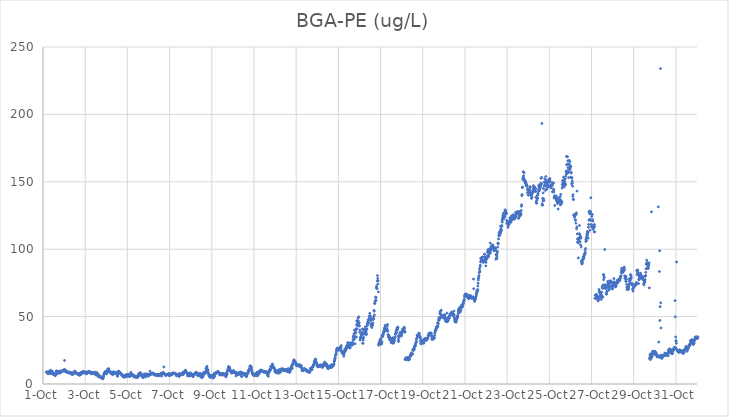
| Category | BGA-PE (ug/L) |
|---|---|
| 44835.166666666664 | 8.73 |
| 44835.177083333336 | 9.15 |
| 44835.1875 | 8.23 |
| 44835.197916666664 | 8.73 |
| 44835.208333333336 | 8.49 |
| 44835.21875 | 7.96 |
| 44835.229166666664 | 7.8 |
| 44835.239583333336 | 7.87 |
| 44835.25 | 8.24 |
| 44835.260416666664 | 7.7 |
| 44835.270833333336 | 7.92 |
| 44835.28125 | 7.89 |
| 44835.291666666664 | 8.7 |
| 44835.302083333336 | 9.3 |
| 44835.3125 | 9.29 |
| 44835.322916666664 | 9.4 |
| 44835.333333333336 | 9.03 |
| 44835.34375 | 9.97 |
| 44835.354166666664 | 8.32 |
| 44835.364583333336 | 7.81 |
| 44835.375 | 7.57 |
| 44835.385416666664 | 9.96 |
| 44835.395833333336 | 9.14 |
| 44835.40625 | 8.86 |
| 44835.416666666664 | 9.18 |
| 44835.427083333336 | 9.05 |
| 44835.4375 | 9.23 |
| 44835.447916666664 | 9.22 |
| 44835.458333333336 | 8.49 |
| 44835.46875 | 8.43 |
| 44835.479166666664 | 7.8 |
| 44835.489583333336 | 7.02 |
| 44835.5 | 7.67 |
| 44835.510416666664 | 7.39 |
| 44835.520833333336 | 7.18 |
| 44835.53125 | 6.99 |
| 44835.541666666664 | 7.69 |
| 44835.552083333336 | 7.57 |
| 44835.5625 | 7.63 |
| 44835.572916666664 | 6.99 |
| 44835.583333333336 | 6.05 |
| 44835.59375 | 7.02 |
| 44835.604166666664 | 7.4 |
| 44835.614583333336 | 7.24 |
| 44835.625 | 9.75 |
| 44835.635416666664 | 9.5 |
| 44835.645833333336 | 7.35 |
| 44835.65625 | 8.25 |
| 44835.666666666664 | 8.86 |
| 44835.677083333336 | 9.27 |
| 44835.6875 | 8.96 |
| 44835.697916666664 | 8.97 |
| 44835.708333333336 | 8.88 |
| 44835.71875 | 8.49 |
| 44835.729166666664 | 8.25 |
| 44835.739583333336 | 8.38 |
| 44835.75 | 9.02 |
| 44835.760416666664 | 8.86 |
| 44835.770833333336 | 9.57 |
| 44835.78125 | 8.42 |
| 44835.791666666664 | 9.23 |
| 44835.802083333336 | 8.09 |
| 44835.8125 | 8.32 |
| 44835.822916666664 | 9.42 |
| 44835.833333333336 | 9.36 |
| 44835.84375 | 8.94 |
| 44835.854166666664 | 9.62 |
| 44835.864583333336 | 9.35 |
| 44835.875 | 8.87 |
| 44835.885416666664 | 9.18 |
| 44835.895833333336 | 9.21 |
| 44835.90625 | 9.68 |
| 44835.916666666664 | 9.38 |
| 44835.927083333336 | 9.69 |
| 44835.9375 | 9.69 |
| 44835.947916666664 | 9.69 |
| 44835.958333333336 | 10.11 |
| 44835.96875 | 10.12 |
| 44835.979166666664 | 10.15 |
| 44835.989583333336 | 9.87 |
| 44836.0 | 10.07 |
| 44836.010416666664 | 10.74 |
| 44836.020833333336 | 17.49 |
| 44836.03125 | 10.54 |
| 44836.041666666664 | 9.27 |
| 44836.052083333336 | 10.19 |
| 44836.0625 | 9.95 |
| 44836.072916666664 | 10.03 |
| 44836.083333333336 | 9.19 |
| 44836.09375 | 9.53 |
| 44836.104166666664 | 9.47 |
| 44836.114583333336 | 9.13 |
| 44836.125 | 9 |
| 44836.135416666664 | 9.13 |
| 44836.145833333336 | 8.71 |
| 44836.15625 | 8.7 |
| 44836.166666666664 | 8.69 |
| 44836.177083333336 | 8.45 |
| 44836.1875 | 8.39 |
| 44836.197916666664 | 8.8 |
| 44836.208333333336 | 8.54 |
| 44836.21875 | 8.36 |
| 44836.229166666664 | 8.53 |
| 44836.239583333336 | 8.58 |
| 44836.25 | 8.68 |
| 44836.260416666664 | 8.42 |
| 44836.270833333336 | 8.1 |
| 44836.28125 | 8.28 |
| 44836.291666666664 | 8.07 |
| 44836.302083333336 | 8.36 |
| 44836.3125 | 8.26 |
| 44836.322916666664 | 8.19 |
| 44836.333333333336 | 8.4 |
| 44836.34375 | 7.56 |
| 44836.354166666664 | 7.6 |
| 44836.364583333336 | 7.79 |
| 44836.375 | 8.11 |
| 44836.385416666664 | 7.23 |
| 44836.395833333336 | 7.06 |
| 44836.40625 | 7.33 |
| 44836.416666666664 | 7.77 |
| 44836.427083333336 | 7.95 |
| 44836.4375 | 7.63 |
| 44836.447916666664 | 8.57 |
| 44836.458333333336 | 8.8 |
| 44836.46875 | 8.13 |
| 44836.479166666664 | 8.2 |
| 44836.489583333336 | 8.27 |
| 44836.5 | 8.37 |
| 44836.510416666664 | 9.6 |
| 44836.520833333336 | 8.76 |
| 44836.53125 | 8.73 |
| 44836.541666666664 | 8.23 |
| 44836.552083333336 | 8.42 |
| 44836.5625 | 8.41 |
| 44836.572916666664 | 8.24 |
| 44836.583333333336 | 8.38 |
| 44836.59375 | 7.82 |
| 44836.604166666664 | 7.89 |
| 44836.614583333336 | 7.71 |
| 44836.625 | 7.58 |
| 44836.635416666664 | 7.51 |
| 44836.645833333336 | 7.41 |
| 44836.65625 | 7.54 |
| 44836.666666666664 | 7.44 |
| 44836.677083333336 | 6.79 |
| 44836.6875 | 7.39 |
| 44836.697916666664 | 7.41 |
| 44836.708333333336 | 7.22 |
| 44836.71875 | 7.69 |
| 44836.729166666664 | 7.05 |
| 44836.739583333336 | 6.42 |
| 44836.75 | 7.07 |
| 44836.760416666664 | 7.7 |
| 44836.770833333336 | 8.22 |
| 44836.78125 | 8.34 |
| 44836.791666666664 | 7.5 |
| 44836.802083333336 | 7.4 |
| 44836.8125 | 7.35 |
| 44836.822916666664 | 8.02 |
| 44836.833333333336 | 8.12 |
| 44836.84375 | 7.96 |
| 44836.854166666664 | 7.76 |
| 44836.864583333336 | 8.06 |
| 44836.875 | 8.67 |
| 44836.885416666664 | 9.03 |
| 44836.895833333336 | 9.26 |
| 44836.90625 | 8.91 |
| 44836.916666666664 | 9.34 |
| 44836.927083333336 | 9.11 |
| 44836.9375 | 8.88 |
| 44836.947916666664 | 9.07 |
| 44836.958333333336 | 8.6 |
| 44836.96875 | 8.56 |
| 44836.979166666664 | 8.49 |
| 44836.989583333336 | 8.52 |
| 44837.0 | 8.44 |
| 44837.010416666664 | 8.11 |
| 44837.020833333336 | 8.66 |
| 44837.03125 | 7.52 |
| 44837.041666666664 | 8.2 |
| 44837.052083333336 | 8.48 |
| 44837.0625 | 8.73 |
| 44837.072916666664 | 8.91 |
| 44837.083333333336 | 8.79 |
| 44837.09375 | 8.26 |
| 44837.104166666664 | 7.92 |
| 44837.114583333336 | 8.44 |
| 44837.125 | 8.32 |
| 44837.135416666664 | 8.52 |
| 44837.145833333336 | 8.74 |
| 44837.15625 | 9.29 |
| 44837.166666666664 | 9.33 |
| 44837.177083333336 | 9.12 |
| 44837.1875 | 9.38 |
| 44837.197916666664 | 9.24 |
| 44837.208333333336 | 9.05 |
| 44837.21875 | 8.78 |
| 44837.229166666664 | 8.23 |
| 44837.239583333336 | 8.84 |
| 44837.25 | 8.5 |
| 44837.260416666664 | 7.97 |
| 44837.270833333336 | 8.73 |
| 44837.28125 | 8.64 |
| 44837.291666666664 | 7.51 |
| 44837.302083333336 | 8.51 |
| 44837.3125 | 8.19 |
| 44837.322916666664 | 8.42 |
| 44837.333333333336 | 8.36 |
| 44837.34375 | 8.6 |
| 44837.354166666664 | 8.4 |
| 44837.364583333336 | 8.21 |
| 44837.375 | 7.99 |
| 44837.385416666664 | 8.44 |
| 44837.395833333336 | 7.85 |
| 44837.40625 | 7.73 |
| 44837.416666666664 | 8.14 |
| 44837.427083333336 | 8.31 |
| 44837.4375 | 8.19 |
| 44837.447916666664 | 8.49 |
| 44837.458333333336 | 8.52 |
| 44837.46875 | 8.28 |
| 44837.479166666664 | 8.39 |
| 44837.489583333336 | 6.84 |
| 44837.5 | 8.57 |
| 44837.510416666664 | 8.69 |
| 44837.520833333336 | 7.88 |
| 44837.53125 | 6.66 |
| 44837.541666666664 | 8.27 |
| 44837.552083333336 | 7.78 |
| 44837.5625 | 8.2 |
| 44837.572916666664 | 7.22 |
| 44837.583333333336 | 7.33 |
| 44837.59375 | 6.43 |
| 44837.604166666664 | 7.64 |
| 44837.614583333336 | 5.62 |
| 44837.625 | 5.96 |
| 44837.635416666664 | 5.52 |
| 44837.645833333336 | 5.78 |
| 44837.65625 | 5.56 |
| 44837.666666666664 | 5.23 |
| 44837.677083333336 | 5.52 |
| 44837.6875 | 6.12 |
| 44837.697916666664 | 5.37 |
| 44837.708333333336 | 5.14 |
| 44837.71875 | 5.33 |
| 44837.729166666664 | 5.36 |
| 44837.739583333336 | 5.48 |
| 44837.75 | 5.03 |
| 44837.760416666664 | 4.68 |
| 44837.770833333336 | 4.79 |
| 44837.78125 | 4.33 |
| 44837.791666666664 | 4.57 |
| 44837.802083333336 | 4.72 |
| 44837.8125 | 4.44 |
| 44837.822916666664 | 4.55 |
| 44837.833333333336 | 3.87 |
| 44837.84375 | 4.31 |
| 44837.854166666664 | 4.49 |
| 44837.864583333336 | 5.57 |
| 44837.875 | 6.04 |
| 44837.885416666664 | 7.16 |
| 44837.895833333336 | 7.34 |
| 44837.90625 | 7.56 |
| 44837.916666666664 | 8.27 |
| 44837.927083333336 | 7.99 |
| 44837.9375 | 8.96 |
| 44837.947916666664 | 8.55 |
| 44837.958333333336 | 9.29 |
| 44837.96875 | 9.1 |
| 44837.979166666664 | 9.06 |
| 44837.989583333336 | 9.36 |
| 44838.0 | 9.49 |
| 44838.010416666664 | 9.47 |
| 44838.020833333336 | 7.49 |
| 44838.03125 | 9.27 |
| 44838.041666666664 | 9.35 |
| 44838.052083333336 | 8.92 |
| 44838.0625 | 11.2 |
| 44838.072916666664 | 9.34 |
| 44838.083333333336 | 9.39 |
| 44838.09375 | 9.73 |
| 44838.104166666664 | 9.53 |
| 44838.114583333336 | 9.96 |
| 44838.125 | 11.31 |
| 44838.135416666664 | 9.77 |
| 44838.145833333336 | 9.34 |
| 44838.15625 | 9.4 |
| 44838.166666666664 | 8.94 |
| 44838.177083333336 | 8.88 |
| 44838.1875 | 8.75 |
| 44838.197916666664 | 8.08 |
| 44838.208333333336 | 8.51 |
| 44838.21875 | 8.68 |
| 44838.229166666664 | 8.61 |
| 44838.239583333336 | 8.23 |
| 44838.25 | 8.42 |
| 44838.260416666664 | 8.54 |
| 44838.270833333336 | 7.3 |
| 44838.28125 | 7.68 |
| 44838.291666666664 | 8.23 |
| 44838.302083333336 | 6.88 |
| 44838.3125 | 8.09 |
| 44838.322916666664 | 8.8 |
| 44838.333333333336 | 7.76 |
| 44838.34375 | 9.09 |
| 44838.354166666664 | 8.45 |
| 44838.364583333336 | 8.16 |
| 44838.375 | 8.23 |
| 44838.385416666664 | 8.4 |
| 44838.395833333336 | 7.86 |
| 44838.40625 | 8.13 |
| 44838.416666666664 | 8.19 |
| 44838.427083333336 | 8.48 |
| 44838.4375 | 8.26 |
| 44838.447916666664 | 8.31 |
| 44838.458333333336 | 8.21 |
| 44838.46875 | 8.03 |
| 44838.479166666664 | 8.07 |
| 44838.489583333336 | 8.33 |
| 44838.5 | 8.28 |
| 44838.510416666664 | 7.92 |
| 44838.520833333336 | 6.36 |
| 44838.53125 | 5.7 |
| 44838.541666666664 | 8.35 |
| 44838.552083333336 | 9.3 |
| 44838.5625 | 8.19 |
| 44838.572916666664 | 7.41 |
| 44838.583333333336 | 8.75 |
| 44838.59375 | 9.49 |
| 44838.604166666664 | 9.05 |
| 44838.614583333336 | 8.68 |
| 44838.625 | 8.79 |
| 44838.635416666664 | 8.03 |
| 44838.645833333336 | 7.99 |
| 44838.65625 | 8.01 |
| 44838.666666666664 | 7.87 |
| 44838.677083333336 | 7.9 |
| 44838.6875 | 7.77 |
| 44838.697916666664 | 7.34 |
| 44838.708333333336 | 7.36 |
| 44838.71875 | 7.48 |
| 44838.729166666664 | 6.9 |
| 44838.739583333336 | 6.68 |
| 44838.75 | 6.62 |
| 44838.760416666664 | 6.19 |
| 44838.770833333336 | 5.82 |
| 44838.78125 | 5.88 |
| 44838.791666666664 | 5.77 |
| 44838.802083333336 | 5.41 |
| 44838.8125 | 5.99 |
| 44838.822916666664 | 5.96 |
| 44838.833333333336 | 5.31 |
| 44838.84375 | 5.08 |
| 44838.854166666664 | 5.43 |
| 44838.864583333336 | 6.33 |
| 44838.875 | 5.18 |
| 44838.885416666664 | 6.48 |
| 44838.895833333336 | 6.54 |
| 44838.90625 | 5.85 |
| 44838.916666666664 | 6.05 |
| 44838.927083333336 | 6.59 |
| 44838.9375 | 6.46 |
| 44838.947916666664 | 5.54 |
| 44838.958333333336 | 5.52 |
| 44838.96875 | 5.86 |
| 44838.979166666664 | 5.85 |
| 44838.989583333336 | 7.11 |
| 44839.0 | 6.45 |
| 44839.010416666664 | 6.73 |
| 44839.020833333336 | 7.08 |
| 44839.03125 | 6.71 |
| 44839.041666666664 | 6.59 |
| 44839.052083333336 | 6.85 |
| 44839.0625 | 6.46 |
| 44839.072916666664 | 5.8 |
| 44839.083333333336 | 5.86 |
| 44839.09375 | 6.62 |
| 44839.104166666664 | 6.06 |
| 44839.114583333336 | 5.72 |
| 44839.125 | 5.65 |
| 44839.135416666664 | 6.16 |
| 44839.145833333336 | 6 |
| 44839.15625 | 7.77 |
| 44839.166666666664 | 8.7 |
| 44839.177083333336 | 6.95 |
| 44839.1875 | 7.59 |
| 44839.197916666664 | 7.21 |
| 44839.208333333336 | 7.19 |
| 44839.21875 | 7.29 |
| 44839.229166666664 | 6.84 |
| 44839.239583333336 | 6.84 |
| 44839.25 | 6.71 |
| 44839.260416666664 | 6.55 |
| 44839.270833333336 | 6.06 |
| 44839.28125 | 6.54 |
| 44839.291666666664 | 6.21 |
| 44839.302083333336 | 6.12 |
| 44839.3125 | 5.1 |
| 44839.322916666664 | 5.98 |
| 44839.333333333336 | 5.54 |
| 44839.34375 | 5.82 |
| 44839.354166666664 | 5.72 |
| 44839.364583333336 | 5.55 |
| 44839.375 | 5.7 |
| 44839.385416666664 | 5.36 |
| 44839.395833333336 | 4.9 |
| 44839.40625 | 5.46 |
| 44839.416666666664 | 5.31 |
| 44839.427083333336 | 5.65 |
| 44839.4375 | 5.23 |
| 44839.447916666664 | 5.71 |
| 44839.458333333336 | 5.51 |
| 44839.46875 | 4.8 |
| 44839.479166666664 | 5.87 |
| 44839.489583333336 | 5.25 |
| 44839.5 | 5.11 |
| 44839.510416666664 | 6.44 |
| 44839.520833333336 | 6.13 |
| 44839.53125 | 6.06 |
| 44839.541666666664 | 7.74 |
| 44839.552083333336 | 6.54 |
| 44839.5625 | 7.62 |
| 44839.572916666664 | 8.03 |
| 44839.583333333336 | 7.71 |
| 44839.59375 | 7.93 |
| 44839.604166666664 | 8.04 |
| 44839.614583333336 | 7.98 |
| 44839.625 | 8.36 |
| 44839.635416666664 | 7.79 |
| 44839.645833333336 | 7.01 |
| 44839.65625 | 7.1 |
| 44839.666666666664 | 6.68 |
| 44839.677083333336 | 6.65 |
| 44839.6875 | 5.85 |
| 44839.697916666664 | 5.86 |
| 44839.708333333336 | 5.36 |
| 44839.71875 | 5.21 |
| 44839.729166666664 | 5.1 |
| 44839.739583333336 | 5.11 |
| 44839.75 | 4.81 |
| 44839.760416666664 | 6.39 |
| 44839.770833333336 | 6.11 |
| 44839.78125 | 7.27 |
| 44839.791666666664 | 6.82 |
| 44839.802083333336 | 7.05 |
| 44839.8125 | 7.29 |
| 44839.822916666664 | 7.04 |
| 44839.833333333336 | 6.45 |
| 44839.84375 | 5.55 |
| 44839.854166666664 | 5.25 |
| 44839.864583333336 | 7.27 |
| 44839.875 | 6.33 |
| 44839.885416666664 | 7.26 |
| 44839.895833333336 | 7.24 |
| 44839.90625 | 7.38 |
| 44839.916666666664 | 7 |
| 44839.927083333336 | 6.67 |
| 44839.9375 | 7.12 |
| 44839.947916666664 | 5.98 |
| 44839.958333333336 | 6.73 |
| 44839.96875 | 5.89 |
| 44839.979166666664 | 6.9 |
| 44839.989583333336 | 6.15 |
| 44840.0 | 6.16 |
| 44840.010416666664 | 6.94 |
| 44840.020833333336 | 6.96 |
| 44840.03125 | 6.73 |
| 44840.041666666664 | 6.58 |
| 44840.052083333336 | 6.71 |
| 44840.0625 | 7.33 |
| 44840.072916666664 | 9.5 |
| 44840.083333333336 | 7.48 |
| 44840.09375 | 7.4 |
| 44840.104166666664 | 7.47 |
| 44840.114583333336 | 7.34 |
| 44840.125 | 7.53 |
| 44840.135416666664 | 7.64 |
| 44840.145833333336 | 7.42 |
| 44840.15625 | 7.69 |
| 44840.166666666664 | 7.71 |
| 44840.177083333336 | 7.64 |
| 44840.1875 | 8.14 |
| 44840.197916666664 | 7.61 |
| 44840.208333333336 | 7.88 |
| 44840.21875 | 7.58 |
| 44840.229166666664 | 7.99 |
| 44840.239583333336 | 7.18 |
| 44840.25 | 7.28 |
| 44840.260416666664 | 7.36 |
| 44840.270833333336 | 7.04 |
| 44840.28125 | 7.13 |
| 44840.291666666664 | 6.54 |
| 44840.302083333336 | 7.17 |
| 44840.3125 | 7 |
| 44840.322916666664 | 7.13 |
| 44840.333333333336 | 7.06 |
| 44840.34375 | 6.94 |
| 44840.354166666664 | 6.88 |
| 44840.364583333336 | 6.43 |
| 44840.375 | 6.41 |
| 44840.385416666664 | 6.81 |
| 44840.395833333336 | 6.76 |
| 44840.40625 | 6.69 |
| 44840.416666666664 | 6.68 |
| 44840.427083333336 | 6.97 |
| 44840.4375 | 6.87 |
| 44840.447916666664 | 7.17 |
| 44840.458333333336 | 6.86 |
| 44840.46875 | 6.3 |
| 44840.479166666664 | 6.78 |
| 44840.489583333336 | 6.13 |
| 44840.5 | 6.77 |
| 44840.510416666664 | 6.74 |
| 44840.520833333336 | 6.72 |
| 44840.53125 | 6.63 |
| 44840.541666666664 | 6.49 |
| 44840.552083333336 | 7.21 |
| 44840.5625 | 6.81 |
| 44840.572916666664 | 7.48 |
| 44840.583333333336 | 7.74 |
| 44840.59375 | 6.93 |
| 44840.604166666664 | 8.07 |
| 44840.614583333336 | 7.06 |
| 44840.625 | 5.86 |
| 44840.635416666664 | 7.89 |
| 44840.645833333336 | 7.91 |
| 44840.65625 | 7.98 |
| 44840.666666666664 | 8.02 |
| 44840.677083333336 | 7.83 |
| 44840.6875 | 7.63 |
| 44840.697916666664 | 8.28 |
| 44840.708333333336 | 8.42 |
| 44840.71875 | 8.29 |
| 44840.729166666664 | 12.67 |
| 44840.739583333336 | 7.87 |
| 44840.75 | 7.82 |
| 44840.760416666664 | 7.52 |
| 44840.770833333336 | 6.98 |
| 44840.78125 | 7.06 |
| 44840.791666666664 | 6.66 |
| 44840.802083333336 | 6.46 |
| 44840.8125 | 6.8 |
| 44840.822916666664 | 6.65 |
| 44840.833333333336 | 6.92 |
| 44840.84375 | 6.87 |
| 44840.854166666664 | 6.97 |
| 44840.864583333336 | 6.68 |
| 44840.875 | 7.05 |
| 44840.885416666664 | 7.12 |
| 44840.895833333336 | 7.07 |
| 44840.90625 | 7.08 |
| 44840.916666666664 | 6.82 |
| 44840.927083333336 | 7.13 |
| 44840.9375 | 7.09 |
| 44840.947916666664 | 7.22 |
| 44840.958333333336 | 7.88 |
| 44840.96875 | 6.41 |
| 44840.979166666664 | 7.33 |
| 44840.989583333336 | 6.38 |
| 44841.0 | 6.57 |
| 44841.010416666664 | 6.11 |
| 44841.020833333336 | 7.06 |
| 44841.03125 | 7.15 |
| 44841.041666666664 | 7 |
| 44841.052083333336 | 7.35 |
| 44841.0625 | 7.05 |
| 44841.072916666664 | 7.18 |
| 44841.083333333336 | 7.44 |
| 44841.09375 | 6.83 |
| 44841.104166666664 | 7.29 |
| 44841.114583333336 | 7.43 |
| 44841.125 | 7.45 |
| 44841.135416666664 | 7.69 |
| 44841.145833333336 | 7.88 |
| 44841.15625 | 8.28 |
| 44841.166666666664 | 7.91 |
| 44841.177083333336 | 8 |
| 44841.1875 | 7.75 |
| 44841.197916666664 | 7.66 |
| 44841.208333333336 | 7.86 |
| 44841.21875 | 7.77 |
| 44841.229166666664 | 8 |
| 44841.239583333336 | 7.76 |
| 44841.25 | 7.81 |
| 44841.260416666664 | 7.83 |
| 44841.270833333336 | 7.72 |
| 44841.28125 | 7.55 |
| 44841.291666666664 | 7.67 |
| 44841.302083333336 | 7.25 |
| 44841.3125 | 7.18 |
| 44841.322916666664 | 6.14 |
| 44841.333333333336 | 6.83 |
| 44841.34375 | 6.66 |
| 44841.354166666664 | 7.1 |
| 44841.364583333336 | 6.56 |
| 44841.375 | 6.97 |
| 44841.385416666664 | 6.69 |
| 44841.395833333336 | 6.95 |
| 44841.40625 | 6.98 |
| 44841.416666666664 | 6.9 |
| 44841.427083333336 | 6.86 |
| 44841.4375 | 7.21 |
| 44841.447916666664 | 5.51 |
| 44841.458333333336 | 6.06 |
| 44841.46875 | 7.87 |
| 44841.479166666664 | 6.77 |
| 44841.489583333336 | 6.97 |
| 44841.5 | 6.88 |
| 44841.510416666664 | 6.8 |
| 44841.520833333336 | 6.92 |
| 44841.53125 | 7.08 |
| 44841.541666666664 | 7.12 |
| 44841.552083333336 | 7.3 |
| 44841.5625 | 7.19 |
| 44841.572916666664 | 7.01 |
| 44841.583333333336 | 7.63 |
| 44841.59375 | 7.78 |
| 44841.604166666664 | 6.91 |
| 44841.614583333336 | 8.43 |
| 44841.625 | 8.09 |
| 44841.635416666664 | 7.78 |
| 44841.645833333336 | 8.26 |
| 44841.65625 | 7.1 |
| 44841.666666666664 | 8.57 |
| 44841.677083333336 | 8.52 |
| 44841.6875 | 8.41 |
| 44841.697916666664 | 8.53 |
| 44841.708333333336 | 9.1 |
| 44841.71875 | 9.55 |
| 44841.729166666664 | 9.63 |
| 44841.739583333336 | 9.43 |
| 44841.75 | 9.46 |
| 44841.760416666664 | 10.2 |
| 44841.770833333336 | 9.24 |
| 44841.78125 | 9.05 |
| 44841.791666666664 | 8.9 |
| 44841.802083333336 | 8.46 |
| 44841.8125 | 8.36 |
| 44841.822916666664 | 7.92 |
| 44841.833333333336 | 7.82 |
| 44841.84375 | 7.75 |
| 44841.854166666664 | 6.08 |
| 44841.864583333336 | 6.17 |
| 44841.875 | 7 |
| 44841.885416666664 | 7.66 |
| 44841.895833333336 | 7.54 |
| 44841.90625 | 7.41 |
| 44841.916666666664 | 7.47 |
| 44841.927083333336 | 7.33 |
| 44841.9375 | 7.1 |
| 44841.947916666664 | 5.89 |
| 44841.958333333336 | 6.12 |
| 44841.96875 | 6.39 |
| 44841.979166666664 | 8.25 |
| 44841.989583333336 | 8.14 |
| 44842.0 | 7.65 |
| 44842.010416666664 | 7.21 |
| 44842.020833333336 | 6.85 |
| 44842.03125 | 7.27 |
| 44842.041666666664 | 7.06 |
| 44842.052083333336 | 7.21 |
| 44842.0625 | 7.02 |
| 44842.072916666664 | 6.95 |
| 44842.083333333336 | 7.06 |
| 44842.09375 | 5.93 |
| 44842.104166666664 | 5.53 |
| 44842.114583333336 | 5.46 |
| 44842.125 | 6.17 |
| 44842.135416666664 | 6.66 |
| 44842.145833333336 | 6.93 |
| 44842.15625 | 6.96 |
| 44842.166666666664 | 7.39 |
| 44842.177083333336 | 7.14 |
| 44842.1875 | 7.75 |
| 44842.197916666664 | 7.95 |
| 44842.208333333336 | 7.27 |
| 44842.21875 | 7.99 |
| 44842.229166666664 | 7.56 |
| 44842.239583333336 | 7.82 |
| 44842.25 | 7.74 |
| 44842.260416666664 | 8.82 |
| 44842.270833333336 | 8.21 |
| 44842.28125 | 7.46 |
| 44842.291666666664 | 7.98 |
| 44842.302083333336 | 8.14 |
| 44842.3125 | 7.5 |
| 44842.322916666664 | 7.21 |
| 44842.333333333336 | 6.2 |
| 44842.34375 | 6.95 |
| 44842.354166666664 | 6.64 |
| 44842.364583333336 | 7.17 |
| 44842.375 | 6.77 |
| 44842.385416666664 | 6.57 |
| 44842.395833333336 | 7.52 |
| 44842.40625 | 7.09 |
| 44842.416666666664 | 6.77 |
| 44842.427083333336 | 6.78 |
| 44842.4375 | 7.94 |
| 44842.447916666664 | 7.63 |
| 44842.458333333336 | 7.45 |
| 44842.46875 | 5.31 |
| 44842.479166666664 | 6.9 |
| 44842.489583333336 | 7.37 |
| 44842.5 | 7.09 |
| 44842.510416666664 | 7.2 |
| 44842.520833333336 | 6.55 |
| 44842.53125 | 4.75 |
| 44842.541666666664 | 6.05 |
| 44842.552083333336 | 5.75 |
| 44842.5625 | 5.12 |
| 44842.572916666664 | 6.23 |
| 44842.583333333336 | 5.77 |
| 44842.59375 | 7.09 |
| 44842.604166666664 | 8.15 |
| 44842.614583333336 | 8.37 |
| 44842.625 | 8.03 |
| 44842.635416666664 | 8.12 |
| 44842.645833333336 | 7.37 |
| 44842.65625 | 8.03 |
| 44842.666666666664 | 8.4 |
| 44842.677083333336 | 8.19 |
| 44842.6875 | 7.85 |
| 44842.697916666664 | 8.48 |
| 44842.708333333336 | 9.16 |
| 44842.71875 | 9.69 |
| 44842.729166666664 | 11.57 |
| 44842.739583333336 | 11.58 |
| 44842.75 | 10.7 |
| 44842.760416666664 | 12.39 |
| 44842.770833333336 | 13.06 |
| 44842.78125 | 10.99 |
| 44842.791666666664 | 10.05 |
| 44842.802083333336 | 10.8 |
| 44842.8125 | 10 |
| 44842.822916666664 | 8.77 |
| 44842.833333333336 | 8.09 |
| 44842.84375 | 7.56 |
| 44842.854166666664 | 7.24 |
| 44842.864583333336 | 6.71 |
| 44842.875 | 6.12 |
| 44842.885416666664 | 5.76 |
| 44842.895833333336 | 5.57 |
| 44842.90625 | 5.43 |
| 44842.916666666664 | 5.24 |
| 44842.927083333336 | 5.07 |
| 44842.9375 | 4.87 |
| 44842.947916666664 | 5.34 |
| 44842.958333333336 | 6.37 |
| 44842.96875 | 5.41 |
| 44842.979166666664 | 5.64 |
| 44842.989583333336 | 6.28 |
| 44843.0 | 6.24 |
| 44843.010416666664 | 6.11 |
| 44843.020833333336 | 5.23 |
| 44843.03125 | 5.95 |
| 44843.041666666664 | 5.55 |
| 44843.052083333336 | 4.98 |
| 44843.0625 | 4.38 |
| 44843.072916666664 | 4.8 |
| 44843.083333333336 | 4.93 |
| 44843.09375 | 6.83 |
| 44843.104166666664 | 7.79 |
| 44843.114583333336 | 6.57 |
| 44843.125 | 5.99 |
| 44843.135416666664 | 5.49 |
| 44843.145833333336 | 7.54 |
| 44843.15625 | 7.81 |
| 44843.166666666664 | 7.53 |
| 44843.177083333336 | 7.4 |
| 44843.1875 | 7.98 |
| 44843.197916666664 | 8.32 |
| 44843.208333333336 | 8.54 |
| 44843.21875 | 8.45 |
| 44843.229166666664 | 8.6 |
| 44843.239583333336 | 8.32 |
| 44843.25 | 8.64 |
| 44843.260416666664 | 8.88 |
| 44843.270833333336 | 8.63 |
| 44843.28125 | 9.01 |
| 44843.291666666664 | 9.45 |
| 44843.302083333336 | 8.29 |
| 44843.3125 | 8.36 |
| 44843.322916666664 | 8.7 |
| 44843.333333333336 | 8.02 |
| 44843.34375 | 8.13 |
| 44843.354166666664 | 8.16 |
| 44843.364583333336 | 7.8 |
| 44843.375 | 7.35 |
| 44843.385416666664 | 6.65 |
| 44843.395833333336 | 6.72 |
| 44843.40625 | 7.18 |
| 44843.416666666664 | 7.66 |
| 44843.427083333336 | 7.66 |
| 44843.4375 | 7.69 |
| 44843.447916666664 | 7.76 |
| 44843.458333333336 | 7.65 |
| 44843.46875 | 7.38 |
| 44843.479166666664 | 7.61 |
| 44843.489583333336 | 7.48 |
| 44843.5 | 6.58 |
| 44843.510416666664 | 7.42 |
| 44843.520833333336 | 7.4 |
| 44843.53125 | 7.39 |
| 44843.541666666664 | 7.57 |
| 44843.552083333336 | 7.59 |
| 44843.5625 | 7.19 |
| 44843.572916666664 | 7.12 |
| 44843.583333333336 | 6.57 |
| 44843.59375 | 6.78 |
| 44843.604166666664 | 6.95 |
| 44843.614583333336 | 6.68 |
| 44843.625 | 6.55 |
| 44843.635416666664 | 7.35 |
| 44843.645833333336 | 7.65 |
| 44843.65625 | 7.77 |
| 44843.666666666664 | 7.17 |
| 44843.677083333336 | 5.24 |
| 44843.6875 | 7.66 |
| 44843.697916666664 | 6.23 |
| 44843.708333333336 | 8.26 |
| 44843.71875 | 7.87 |
| 44843.729166666664 | 7.45 |
| 44843.739583333336 | 9.36 |
| 44843.75 | 9.9 |
| 44843.760416666664 | 10.86 |
| 44843.770833333336 | 10.41 |
| 44843.78125 | 11.82 |
| 44843.791666666664 | 12.92 |
| 44843.802083333336 | 12.6 |
| 44843.8125 | 12.54 |
| 44843.822916666664 | 11.37 |
| 44843.833333333336 | 12.22 |
| 44843.84375 | 12.44 |
| 44843.854166666664 | 11.74 |
| 44843.864583333336 | 10.92 |
| 44843.875 | 10.16 |
| 44843.885416666664 | 9.77 |
| 44843.895833333336 | 9.44 |
| 44843.90625 | 9.21 |
| 44843.916666666664 | 8.8 |
| 44843.927083333336 | 8.6 |
| 44843.9375 | 8.48 |
| 44843.947916666664 | 8.15 |
| 44843.958333333336 | 8.37 |
| 44843.96875 | 8.4 |
| 44843.979166666664 | 8.38 |
| 44843.989583333336 | 8.62 |
| 44844.0 | 8.52 |
| 44844.010416666664 | 8.81 |
| 44844.020833333336 | 9.78 |
| 44844.03125 | 9.98 |
| 44844.041666666664 | 8.98 |
| 44844.052083333336 | 8.93 |
| 44844.0625 | 9.33 |
| 44844.072916666664 | 8.76 |
| 44844.083333333336 | 8.38 |
| 44844.09375 | 8.73 |
| 44844.104166666664 | 8.71 |
| 44844.114583333336 | 8.2 |
| 44844.125 | 8.62 |
| 44844.135416666664 | 7.76 |
| 44844.145833333336 | 5.89 |
| 44844.15625 | 7.86 |
| 44844.166666666664 | 8.42 |
| 44844.177083333336 | 8.14 |
| 44844.1875 | 8.23 |
| 44844.197916666664 | 7.61 |
| 44844.208333333336 | 7.62 |
| 44844.21875 | 7.58 |
| 44844.229166666664 | 7.2 |
| 44844.239583333336 | 6.84 |
| 44844.25 | 7.4 |
| 44844.260416666664 | 6.96 |
| 44844.270833333336 | 7.67 |
| 44844.28125 | 8.19 |
| 44844.291666666664 | 8.36 |
| 44844.302083333336 | 8.16 |
| 44844.3125 | 7.32 |
| 44844.322916666664 | 7.86 |
| 44844.333333333336 | 8.5 |
| 44844.34375 | 8.54 |
| 44844.354166666664 | 8.93 |
| 44844.364583333336 | 8.39 |
| 44844.375 | 8.36 |
| 44844.385416666664 | 8.57 |
| 44844.395833333336 | 7.13 |
| 44844.40625 | 5.85 |
| 44844.416666666664 | 5.43 |
| 44844.427083333336 | 7.61 |
| 44844.4375 | 7.42 |
| 44844.447916666664 | 7.56 |
| 44844.458333333336 | 8.34 |
| 44844.46875 | 7.93 |
| 44844.479166666664 | 8.11 |
| 44844.489583333336 | 7.82 |
| 44844.5 | 7.62 |
| 44844.510416666664 | 7.64 |
| 44844.520833333336 | 7.81 |
| 44844.53125 | 7.52 |
| 44844.541666666664 | 6.49 |
| 44844.552083333336 | 6.93 |
| 44844.5625 | 6.99 |
| 44844.572916666664 | 7.03 |
| 44844.583333333336 | 6.67 |
| 44844.59375 | 7.63 |
| 44844.604166666664 | 7.25 |
| 44844.614583333336 | 6.64 |
| 44844.625 | 6.21 |
| 44844.635416666664 | 6.05 |
| 44844.645833333336 | 5.4 |
| 44844.65625 | 6.13 |
| 44844.666666666664 | 7.09 |
| 44844.677083333336 | 7.98 |
| 44844.6875 | 8.14 |
| 44844.697916666664 | 7.68 |
| 44844.708333333336 | 8.52 |
| 44844.71875 | 8.08 |
| 44844.729166666664 | 8.94 |
| 44844.739583333336 | 9.76 |
| 44844.75 | 10.51 |
| 44844.760416666664 | 9.96 |
| 44844.770833333336 | 10.22 |
| 44844.78125 | 11.06 |
| 44844.791666666664 | 11.1 |
| 44844.802083333336 | 12.93 |
| 44844.8125 | 12.47 |
| 44844.822916666664 | 13.44 |
| 44844.833333333336 | 12.57 |
| 44844.84375 | 13.42 |
| 44844.854166666664 | 11.33 |
| 44844.864583333336 | 12.84 |
| 44844.875 | 12.1 |
| 44844.885416666664 | 10.9 |
| 44844.895833333336 | 9.67 |
| 44844.90625 | 9.12 |
| 44844.916666666664 | 8.59 |
| 44844.927083333336 | 7.39 |
| 44844.9375 | 7.64 |
| 44844.947916666664 | 7.73 |
| 44844.958333333336 | 6.7 |
| 44844.96875 | 6.84 |
| 44844.979166666664 | 6.61 |
| 44844.989583333336 | 6.53 |
| 44845.0 | 6.54 |
| 44845.010416666664 | 6.27 |
| 44845.020833333336 | 6.68 |
| 44845.03125 | 7.04 |
| 44845.041666666664 | 7.07 |
| 44845.052083333336 | 6.79 |
| 44845.0625 | 6.85 |
| 44845.072916666664 | 6.55 |
| 44845.083333333336 | 6.9 |
| 44845.09375 | 6.88 |
| 44845.104166666664 | 6.39 |
| 44845.114583333336 | 7.47 |
| 44845.125 | 8.17 |
| 44845.135416666664 | 8.71 |
| 44845.145833333336 | 6.59 |
| 44845.15625 | 5.95 |
| 44845.166666666664 | 6.44 |
| 44845.177083333336 | 7 |
| 44845.1875 | 6.88 |
| 44845.197916666664 | 7.19 |
| 44845.208333333336 | 7.34 |
| 44845.21875 | 7.06 |
| 44845.229166666664 | 9.01 |
| 44845.239583333336 | 9.06 |
| 44845.25 | 9.72 |
| 44845.260416666664 | 8.12 |
| 44845.270833333336 | 8.99 |
| 44845.28125 | 9.38 |
| 44845.291666666664 | 9.76 |
| 44845.302083333336 | 9.65 |
| 44845.3125 | 9.6 |
| 44845.322916666664 | 10.32 |
| 44845.333333333336 | 9.82 |
| 44845.34375 | 10.3 |
| 44845.354166666664 | 9.72 |
| 44845.364583333336 | 9.83 |
| 44845.375 | 9.6 |
| 44845.385416666664 | 9.53 |
| 44845.395833333336 | 9.55 |
| 44845.40625 | 9.47 |
| 44845.416666666664 | 9.65 |
| 44845.427083333336 | 9.36 |
| 44845.4375 | 9.46 |
| 44845.447916666664 | 9.22 |
| 44845.458333333336 | 8.97 |
| 44845.46875 | 8.96 |
| 44845.479166666664 | 8.95 |
| 44845.489583333336 | 9.01 |
| 44845.5 | 9.08 |
| 44845.510416666664 | 8.8 |
| 44845.520833333336 | 9.41 |
| 44845.53125 | 9.01 |
| 44845.541666666664 | 8.96 |
| 44845.552083333336 | 8.78 |
| 44845.5625 | 8.83 |
| 44845.572916666664 | 8.54 |
| 44845.583333333336 | 8.77 |
| 44845.59375 | 8.2 |
| 44845.604166666664 | 8.98 |
| 44845.614583333336 | 9.08 |
| 44845.625 | 8.18 |
| 44845.635416666664 | 7.96 |
| 44845.645833333336 | 6.67 |
| 44845.65625 | 6.52 |
| 44845.666666666664 | 6.76 |
| 44845.677083333336 | 5.72 |
| 44845.6875 | 7.84 |
| 44845.697916666664 | 8.51 |
| 44845.708333333336 | 8.52 |
| 44845.71875 | 9.28 |
| 44845.729166666664 | 10.38 |
| 44845.739583333336 | 9.78 |
| 44845.75 | 10.59 |
| 44845.760416666664 | 9.72 |
| 44845.770833333336 | 11.03 |
| 44845.78125 | 10.41 |
| 44845.791666666664 | 12.91 |
| 44845.802083333336 | 11.59 |
| 44845.8125 | 11.96 |
| 44845.822916666664 | 13.03 |
| 44845.833333333336 | 13.35 |
| 44845.84375 | 13.58 |
| 44845.854166666664 | 13.07 |
| 44845.864583333336 | 14.78 |
| 44845.875 | 14.06 |
| 44845.885416666664 | 14.55 |
| 44845.895833333336 | 13.59 |
| 44845.90625 | 12.79 |
| 44845.916666666664 | 12.28 |
| 44845.927083333336 | 12.1 |
| 44845.9375 | 12.04 |
| 44845.947916666664 | 12.01 |
| 44845.958333333336 | 11.62 |
| 44845.96875 | 11.18 |
| 44845.979166666664 | 10.86 |
| 44845.989583333336 | 9.72 |
| 44846.0 | 8.88 |
| 44846.010416666664 | 9.06 |
| 44846.020833333336 | 9.99 |
| 44846.03125 | 10.01 |
| 44846.041666666664 | 8.7 |
| 44846.052083333336 | 9.09 |
| 44846.0625 | 8.86 |
| 44846.072916666664 | 9.46 |
| 44846.083333333336 | 8.68 |
| 44846.09375 | 8.14 |
| 44846.104166666664 | 8.76 |
| 44846.114583333336 | 9.71 |
| 44846.125 | 9.47 |
| 44846.135416666664 | 9.45 |
| 44846.145833333336 | 8.86 |
| 44846.15625 | 8.6 |
| 44846.166666666664 | 7.88 |
| 44846.177083333336 | 9.53 |
| 44846.1875 | 10.11 |
| 44846.197916666664 | 10.74 |
| 44846.208333333336 | 10.33 |
| 44846.21875 | 9.9 |
| 44846.229166666664 | 8.67 |
| 44846.239583333336 | 9.64 |
| 44846.25 | 10.27 |
| 44846.260416666664 | 8.93 |
| 44846.270833333336 | 11.05 |
| 44846.28125 | 10.59 |
| 44846.291666666664 | 10.57 |
| 44846.302083333336 | 10.83 |
| 44846.3125 | 10.65 |
| 44846.322916666664 | 11.01 |
| 44846.333333333336 | 10.63 |
| 44846.34375 | 11.16 |
| 44846.354166666664 | 11.29 |
| 44846.364583333336 | 11.2 |
| 44846.375 | 10.6 |
| 44846.385416666664 | 10.86 |
| 44846.395833333336 | 10.19 |
| 44846.40625 | 9.73 |
| 44846.416666666664 | 10.3 |
| 44846.427083333336 | 10.63 |
| 44846.4375 | 10.24 |
| 44846.447916666664 | 10.25 |
| 44846.458333333336 | 10.1 |
| 44846.46875 | 10.38 |
| 44846.479166666664 | 9.92 |
| 44846.489583333336 | 10.03 |
| 44846.5 | 10.11 |
| 44846.510416666664 | 9.98 |
| 44846.520833333336 | 10.93 |
| 44846.53125 | 9.77 |
| 44846.541666666664 | 10.12 |
| 44846.552083333336 | 9.9 |
| 44846.5625 | 10.36 |
| 44846.572916666664 | 9.53 |
| 44846.583333333336 | 9.28 |
| 44846.59375 | 9.28 |
| 44846.604166666664 | 9.34 |
| 44846.614583333336 | 10.04 |
| 44846.625 | 11.41 |
| 44846.635416666664 | 9.82 |
| 44846.645833333336 | 9.53 |
| 44846.65625 | 10.48 |
| 44846.666666666664 | 10.92 |
| 44846.677083333336 | 9.22 |
| 44846.6875 | 8.53 |
| 44846.697916666664 | 9.75 |
| 44846.708333333336 | 9 |
| 44846.71875 | 10.18 |
| 44846.729166666664 | 10.14 |
| 44846.739583333336 | 11.29 |
| 44846.75 | 10.99 |
| 44846.760416666664 | 12.15 |
| 44846.770833333336 | 12.37 |
| 44846.78125 | 13.29 |
| 44846.791666666664 | 13.06 |
| 44846.802083333336 | 13.32 |
| 44846.8125 | 11.58 |
| 44846.822916666664 | 14.2 |
| 44846.833333333336 | 14.65 |
| 44846.84375 | 15.17 |
| 44846.854166666664 | 15.61 |
| 44846.864583333336 | 16.11 |
| 44846.875 | 16.75 |
| 44846.885416666664 | 17.37 |
| 44846.895833333336 | 17.96 |
| 44846.90625 | 16.83 |
| 44846.916666666664 | 16.71 |
| 44846.927083333336 | 16.7 |
| 44846.9375 | 16.54 |
| 44846.947916666664 | 17.03 |
| 44846.958333333336 | 16.19 |
| 44846.96875 | 15.93 |
| 44846.979166666664 | 14.65 |
| 44846.989583333336 | 14.87 |
| 44847.0 | 14.6 |
| 44847.010416666664 | 13.55 |
| 44847.020833333336 | 14.74 |
| 44847.03125 | 14.77 |
| 44847.041666666664 | 14.12 |
| 44847.052083333336 | 14.32 |
| 44847.0625 | 13.52 |
| 44847.072916666664 | 13.97 |
| 44847.083333333336 | 13.78 |
| 44847.09375 | 13.85 |
| 44847.104166666664 | 14.01 |
| 44847.114583333336 | 13.45 |
| 44847.125 | 13.89 |
| 44847.135416666664 | 13.74 |
| 44847.145833333336 | 14.22 |
| 44847.15625 | 13.95 |
| 44847.166666666664 | 13.1 |
| 44847.177083333336 | 14.22 |
| 44847.1875 | 13.05 |
| 44847.197916666664 | 13.22 |
| 44847.208333333336 | 13.56 |
| 44847.21875 | 12.8 |
| 44847.229166666664 | 13.68 |
| 44847.239583333336 | 13.57 |
| 44847.25 | 11.96 |
| 44847.260416666664 | 12.16 |
| 44847.270833333336 | 11.46 |
| 44847.28125 | 9.97 |
| 44847.291666666664 | 10.01 |
| 44847.302083333336 | 10.1 |
| 44847.3125 | 10.16 |
| 44847.322916666664 | 10.23 |
| 44847.333333333336 | 10.3 |
| 44847.34375 | 10.26 |
| 44847.354166666664 | 10.55 |
| 44847.364583333336 | 10.92 |
| 44847.375 | 11.1 |
| 44847.385416666664 | 11.6 |
| 44847.395833333336 | 10.98 |
| 44847.40625 | 10.65 |
| 44847.416666666664 | 10.52 |
| 44847.427083333336 | 10.57 |
| 44847.4375 | 10.74 |
| 44847.447916666664 | 10.52 |
| 44847.458333333336 | 10.83 |
| 44847.46875 | 10.32 |
| 44847.479166666664 | 9.96 |
| 44847.489583333336 | 10.41 |
| 44847.5 | 9.96 |
| 44847.510416666664 | 9.6 |
| 44847.520833333336 | 9.48 |
| 44847.53125 | 9.61 |
| 44847.541666666664 | 9.19 |
| 44847.552083333336 | 9.26 |
| 44847.5625 | 9.02 |
| 44847.572916666664 | 8.94 |
| 44847.583333333336 | 9.33 |
| 44847.59375 | 9.18 |
| 44847.604166666664 | 9.12 |
| 44847.614583333336 | 8.73 |
| 44847.625 | 9.28 |
| 44847.635416666664 | 9.32 |
| 44847.645833333336 | 8.68 |
| 44847.65625 | 10.07 |
| 44847.666666666664 | 10.7 |
| 44847.677083333336 | 11.59 |
| 44847.6875 | 10.82 |
| 44847.697916666664 | 11.69 |
| 44847.708333333336 | 10.43 |
| 44847.71875 | 11.1 |
| 44847.729166666664 | 11.05 |
| 44847.739583333336 | 10.58 |
| 44847.75 | 10.91 |
| 44847.760416666664 | 12.38 |
| 44847.770833333336 | 12.46 |
| 44847.78125 | 12.65 |
| 44847.791666666664 | 12.67 |
| 44847.802083333336 | 13.91 |
| 44847.8125 | 13.04 |
| 44847.822916666664 | 13.88 |
| 44847.833333333336 | 14.34 |
| 44847.84375 | 14.78 |
| 44847.854166666664 | 15.96 |
| 44847.864583333336 | 16.33 |
| 44847.875 | 17.1 |
| 44847.885416666664 | 17.48 |
| 44847.895833333336 | 17.05 |
| 44847.90625 | 18.1 |
| 44847.916666666664 | 18.49 |
| 44847.927083333336 | 17.9 |
| 44847.9375 | 16.42 |
| 44847.947916666664 | 16.03 |
| 44847.958333333336 | 15.55 |
| 44847.96875 | 15.77 |
| 44847.979166666664 | 14.95 |
| 44847.989583333336 | 14.02 |
| 44848.0 | 13.51 |
| 44848.010416666664 | 13.8 |
| 44848.020833333336 | 12.76 |
| 44848.03125 | 13.14 |
| 44848.041666666664 | 13.81 |
| 44848.052083333336 | 12.96 |
| 44848.0625 | 13.33 |
| 44848.072916666664 | 13 |
| 44848.083333333336 | 13.17 |
| 44848.09375 | 13.85 |
| 44848.104166666664 | 13.59 |
| 44848.114583333336 | 13.25 |
| 44848.125 | 13.74 |
| 44848.135416666664 | 13.38 |
| 44848.145833333336 | 14.1 |
| 44848.15625 | 14.08 |
| 44848.166666666664 | 13.87 |
| 44848.177083333336 | 13.49 |
| 44848.1875 | 13.17 |
| 44848.197916666664 | 13.61 |
| 44848.208333333336 | 12.9 |
| 44848.21875 | 13.73 |
| 44848.229166666664 | 12.42 |
| 44848.239583333336 | 12.61 |
| 44848.25 | 12.39 |
| 44848.260416666664 | 13.05 |
| 44848.270833333336 | 13.17 |
| 44848.28125 | 13.09 |
| 44848.291666666664 | 14.92 |
| 44848.302083333336 | 14.35 |
| 44848.3125 | 14.31 |
| 44848.322916666664 | 14.85 |
| 44848.333333333336 | 15.03 |
| 44848.34375 | 16.17 |
| 44848.354166666664 | 15.51 |
| 44848.364583333336 | 15.62 |
| 44848.375 | 14.63 |
| 44848.385416666664 | 14.25 |
| 44848.395833333336 | 13.62 |
| 44848.40625 | 14.54 |
| 44848.416666666664 | 14.32 |
| 44848.427083333336 | 15.12 |
| 44848.4375 | 14.45 |
| 44848.447916666664 | 13.85 |
| 44848.458333333336 | 14.35 |
| 44848.46875 | 13.41 |
| 44848.479166666664 | 12.91 |
| 44848.489583333336 | 12.4 |
| 44848.5 | 11.96 |
| 44848.510416666664 | 11.65 |
| 44848.520833333336 | 11.32 |
| 44848.53125 | 12.49 |
| 44848.541666666664 | 11.98 |
| 44848.552083333336 | 12.75 |
| 44848.5625 | 12.82 |
| 44848.572916666664 | 13.05 |
| 44848.583333333336 | 13.17 |
| 44848.59375 | 12.98 |
| 44848.604166666664 | 12.82 |
| 44848.614583333336 | 12.65 |
| 44848.625 | 12.77 |
| 44848.635416666664 | 12.86 |
| 44848.645833333336 | 13.03 |
| 44848.65625 | 12.12 |
| 44848.666666666664 | 13.83 |
| 44848.677083333336 | 14.24 |
| 44848.6875 | 14.2 |
| 44848.697916666664 | 12.96 |
| 44848.708333333336 | 12.78 |
| 44848.71875 | 12.92 |
| 44848.729166666664 | 13.43 |
| 44848.739583333336 | 13.48 |
| 44848.75 | 14.06 |
| 44848.760416666664 | 13.72 |
| 44848.770833333336 | 14 |
| 44848.78125 | 14.2 |
| 44848.791666666664 | 15.13 |
| 44848.802083333336 | 16.84 |
| 44848.8125 | 16.93 |
| 44848.822916666664 | 17.65 |
| 44848.833333333336 | 18.55 |
| 44848.84375 | 18.64 |
| 44848.854166666664 | 19.72 |
| 44848.864583333336 | 21.17 |
| 44848.875 | 21.65 |
| 44848.885416666664 | 22.09 |
| 44848.895833333336 | 22.94 |
| 44848.90625 | 24.06 |
| 44848.916666666664 | 25.43 |
| 44848.927083333336 | 25.36 |
| 44848.9375 | 26.31 |
| 44848.947916666664 | 26.51 |
| 44848.958333333336 | 26.43 |
| 44848.96875 | 25.47 |
| 44848.979166666664 | 26.06 |
| 44848.989583333336 | 25.5 |
| 44849.0 | 26.35 |
| 44849.010416666664 | 25.96 |
| 44849.020833333336 | 25.11 |
| 44849.03125 | 25.41 |
| 44849.041666666664 | 25.41 |
| 44849.052083333336 | 25.63 |
| 44849.0625 | 26.38 |
| 44849.072916666664 | 26.32 |
| 44849.083333333336 | 27.08 |
| 44849.09375 | 27.31 |
| 44849.104166666664 | 27.25 |
| 44849.114583333336 | 27.09 |
| 44849.125 | 26.95 |
| 44849.135416666664 | 28.52 |
| 44849.145833333336 | 24.69 |
| 44849.15625 | 23.88 |
| 44849.166666666664 | 24.45 |
| 44849.177083333336 | 23.88 |
| 44849.1875 | 23.61 |
| 44849.197916666664 | 22.76 |
| 44849.208333333336 | 22.28 |
| 44849.21875 | 22.9 |
| 44849.229166666664 | 23.89 |
| 44849.239583333336 | 23.24 |
| 44849.25 | 23.74 |
| 44849.260416666664 | 20.57 |
| 44849.270833333336 | 21.98 |
| 44849.28125 | 23.83 |
| 44849.291666666664 | 24.1 |
| 44849.302083333336 | 25.77 |
| 44849.3125 | 23.78 |
| 44849.322916666664 | 24.13 |
| 44849.333333333336 | 25.96 |
| 44849.34375 | 25.56 |
| 44849.354166666664 | 25.72 |
| 44849.364583333336 | 25.69 |
| 44849.375 | 27.06 |
| 44849.385416666664 | 28.22 |
| 44849.395833333336 | 26.82 |
| 44849.40625 | 27.38 |
| 44849.416666666664 | 28.33 |
| 44849.427083333336 | 28.36 |
| 44849.4375 | 28.83 |
| 44849.447916666664 | 30.54 |
| 44849.458333333336 | 30.61 |
| 44849.46875 | 30.18 |
| 44849.479166666664 | 29.33 |
| 44849.489583333336 | 30.31 |
| 44849.5 | 28.12 |
| 44849.510416666664 | 29.3 |
| 44849.520833333336 | 28.46 |
| 44849.53125 | 26.88 |
| 44849.541666666664 | 27.55 |
| 44849.552083333336 | 26.74 |
| 44849.5625 | 27.25 |
| 44849.572916666664 | 29.73 |
| 44849.583333333336 | 30.54 |
| 44849.59375 | 29.77 |
| 44849.604166666664 | 29.31 |
| 44849.614583333336 | 29.34 |
| 44849.625 | 29.61 |
| 44849.635416666664 | 30.35 |
| 44849.645833333336 | 30.2 |
| 44849.65625 | 29.79 |
| 44849.666666666664 | 28.94 |
| 44849.677083333336 | 30.85 |
| 44849.6875 | 30.15 |
| 44849.697916666664 | 32.81 |
| 44849.708333333336 | 34.54 |
| 44849.71875 | 35.04 |
| 44849.729166666664 | 36.14 |
| 44849.739583333336 | 32.95 |
| 44849.75 | 37.31 |
| 44849.760416666664 | 39.91 |
| 44849.770833333336 | 35.32 |
| 44849.78125 | 34.26 |
| 44849.791666666664 | 29.85 |
| 44849.802083333336 | 38.17 |
| 44849.8125 | 38.3 |
| 44849.822916666664 | 39.88 |
| 44849.833333333336 | 37.84 |
| 44849.84375 | 41.01 |
| 44849.854166666664 | 34.87 |
| 44849.864583333336 | 43.79 |
| 44849.875 | 47 |
| 44849.885416666664 | 40.9 |
| 44849.895833333336 | 46.31 |
| 44849.90625 | 44.88 |
| 44849.916666666664 | 43.38 |
| 44849.927083333336 | 43.35 |
| 44849.9375 | 48.88 |
| 44849.947916666664 | 46.84 |
| 44849.958333333336 | 45.03 |
| 44849.96875 | 49.87 |
| 44849.979166666664 | 43.37 |
| 44849.989583333336 | 45.33 |
| 44850.0 | 43.06 |
| 44850.010416666664 | 38.41 |
| 44850.020833333336 | 39.97 |
| 44850.03125 | 32.59 |
| 44850.041666666664 | 33.96 |
| 44850.052083333336 | 33.62 |
| 44850.0625 | 34.72 |
| 44850.072916666664 | 35.26 |
| 44850.083333333336 | 36.81 |
| 44850.09375 | 36.96 |
| 44850.104166666664 | 36.37 |
| 44850.114583333336 | 36.72 |
| 44850.125 | 38.52 |
| 44850.135416666664 | 40.81 |
| 44850.145833333336 | 37.11 |
| 44850.15625 | 30.3 |
| 44850.166666666664 | 30.2 |
| 44850.177083333336 | 32.49 |
| 44850.1875 | 34.04 |
| 44850.197916666664 | 34.56 |
| 44850.208333333336 | 36.94 |
| 44850.21875 | 37.24 |
| 44850.229166666664 | 40.62 |
| 44850.239583333336 | 38.81 |
| 44850.25 | 39.88 |
| 44850.260416666664 | 40.21 |
| 44850.270833333336 | 42.26 |
| 44850.28125 | 39.79 |
| 44850.291666666664 | 39.37 |
| 44850.302083333336 | 37.43 |
| 44850.3125 | 38.82 |
| 44850.322916666664 | 36.52 |
| 44850.333333333336 | 37.42 |
| 44850.34375 | 40.63 |
| 44850.354166666664 | 40.67 |
| 44850.364583333336 | 43.03 |
| 44850.375 | 44.63 |
| 44850.385416666664 | 44.01 |
| 44850.395833333336 | 46.01 |
| 44850.40625 | 45.88 |
| 44850.416666666664 | 47.5 |
| 44850.427083333336 | 47.46 |
| 44850.4375 | 47.45 |
| 44850.447916666664 | 45.23 |
| 44850.458333333336 | 48.46 |
| 44850.46875 | 50.1 |
| 44850.479166666664 | 50.31 |
| 44850.489583333336 | 52.43 |
| 44850.5 | 50.68 |
| 44850.510416666664 | 50.47 |
| 44850.520833333336 | 49.2 |
| 44850.53125 | 48.19 |
| 44850.541666666664 | 47.01 |
| 44850.552083333336 | 43.23 |
| 44850.5625 | 44.55 |
| 44850.572916666664 | 44.51 |
| 44850.583333333336 | 41.87 |
| 44850.59375 | 43.49 |
| 44850.604166666664 | 44.16 |
| 44850.614583333336 | 43.42 |
| 44850.625 | 44.61 |
| 44850.635416666664 | 45.31 |
| 44850.645833333336 | 47.88 |
| 44850.65625 | 48.75 |
| 44850.666666666664 | 48.28 |
| 44850.677083333336 | 50.05 |
| 44850.6875 | 54.64 |
| 44850.697916666664 | 53.98 |
| 44850.708333333336 | 51.26 |
| 44850.71875 | 59.84 |
| 44850.729166666664 | 59.72 |
| 44850.739583333336 | 61.16 |
| 44850.75 | 61.67 |
| 44850.760416666664 | 64.42 |
| 44850.770833333336 | 62.27 |
| 44850.78125 | 62.04 |
| 44850.791666666664 | 64.22 |
| 44850.802083333336 | 71.42 |
| 44850.8125 | 72.8 |
| 44850.822916666664 | 70.84 |
| 44850.833333333336 | 71 |
| 44850.84375 | 76.5 |
| 44850.854166666664 | 80.42 |
| 44850.864583333336 | 78.29 |
| 44850.875 | 74.28 |
| 44850.885416666664 | 76.57 |
| 44850.895833333336 | 68.36 |
| 44850.90625 | 29.49 |
| 44850.916666666664 | 28.81 |
| 44850.927083333336 | 29.83 |
| 44850.9375 | 30.49 |
| 44850.947916666664 | 30.82 |
| 44850.958333333336 | 31.13 |
| 44850.96875 | 31.93 |
| 44850.979166666664 | 32.69 |
| 44850.989583333336 | 31.68 |
| 44851.0 | 33.02 |
| 44851.010416666664 | 33.59 |
| 44851.020833333336 | 29.53 |
| 44851.03125 | 29.85 |
| 44851.041666666664 | 29.97 |
| 44851.052083333336 | 30.18 |
| 44851.0625 | 31.42 |
| 44851.072916666664 | 36.23 |
| 44851.083333333336 | 35.02 |
| 44851.09375 | 35.17 |
| 44851.104166666664 | 35.84 |
| 44851.114583333336 | 36.32 |
| 44851.125 | 36.84 |
| 44851.135416666664 | 37.71 |
| 44851.145833333336 | 38.44 |
| 44851.15625 | 38.94 |
| 44851.166666666664 | 39.94 |
| 44851.177083333336 | 39.23 |
| 44851.1875 | 41.28 |
| 44851.197916666664 | 41.72 |
| 44851.208333333336 | 41.52 |
| 44851.21875 | 43.24 |
| 44851.229166666664 | 43.44 |
| 44851.239583333336 | 39.42 |
| 44851.25 | 40.1 |
| 44851.260416666664 | 40.52 |
| 44851.270833333336 | 40.06 |
| 44851.28125 | 39.79 |
| 44851.291666666664 | 39.74 |
| 44851.302083333336 | 40.6 |
| 44851.3125 | 42.66 |
| 44851.322916666664 | 40.41 |
| 44851.333333333336 | 44.14 |
| 44851.34375 | 39.1 |
| 44851.354166666664 | 36.56 |
| 44851.364583333336 | 36.43 |
| 44851.375 | 34.71 |
| 44851.385416666664 | 35.85 |
| 44851.395833333336 | 35.72 |
| 44851.40625 | 35.27 |
| 44851.416666666664 | 34.88 |
| 44851.427083333336 | 33.88 |
| 44851.4375 | 32.7 |
| 44851.447916666664 | 32.94 |
| 44851.458333333336 | 32.9 |
| 44851.46875 | 33.6 |
| 44851.479166666664 | 33.9 |
| 44851.489583333336 | 33.02 |
| 44851.5 | 31.02 |
| 44851.510416666664 | 32.11 |
| 44851.520833333336 | 30.73 |
| 44851.53125 | 32.41 |
| 44851.541666666664 | 30.47 |
| 44851.552083333336 | 32.37 |
| 44851.5625 | 34.24 |
| 44851.572916666664 | 31.75 |
| 44851.583333333336 | 30.3 |
| 44851.59375 | 30.67 |
| 44851.604166666664 | 32.74 |
| 44851.614583333336 | 30.41 |
| 44851.625 | 32.83 |
| 44851.635416666664 | 33.87 |
| 44851.645833333336 | 32.27 |
| 44851.65625 | 31.84 |
| 44851.666666666664 | 33.85 |
| 44851.677083333336 | 34.93 |
| 44851.6875 | 34.66 |
| 44851.697916666664 | 37.19 |
| 44851.708333333336 | 36.91 |
| 44851.71875 | 37.17 |
| 44851.729166666664 | 37.81 |
| 44851.739583333336 | 38.77 |
| 44851.75 | 39.93 |
| 44851.760416666664 | 38.12 |
| 44851.770833333336 | 40 |
| 44851.78125 | 41.62 |
| 44851.791666666664 | 40.97 |
| 44851.802083333336 | 40.5 |
| 44851.8125 | 41.83 |
| 44851.822916666664 | 42.26 |
| 44851.833333333336 | 35.52 |
| 44851.84375 | 32.34 |
| 44851.854166666664 | 31.56 |
| 44851.864583333336 | 33.87 |
| 44851.875 | 35.63 |
| 44851.885416666664 | 35.81 |
| 44851.895833333336 | 35.96 |
| 44851.90625 | 35.79 |
| 44851.916666666664 | 37 |
| 44851.927083333336 | 38.36 |
| 44851.9375 | 37.22 |
| 44851.947916666664 | 37.66 |
| 44851.958333333336 | 38.03 |
| 44851.96875 | 36.6 |
| 44851.979166666664 | 35.47 |
| 44851.989583333336 | 36.26 |
| 44852.0 | 36.35 |
| 44852.010416666664 | 38.87 |
| 44852.020833333336 | 37.91 |
| 44852.03125 | 38.86 |
| 44852.041666666664 | 39.85 |
| 44852.052083333336 | 40.67 |
| 44852.0625 | 41.01 |
| 44852.072916666664 | 40.53 |
| 44852.083333333336 | 40.45 |
| 44852.09375 | 40.07 |
| 44852.104166666664 | 39.67 |
| 44852.114583333336 | 41.19 |
| 44852.125 | 42.06 |
| 44852.135416666664 | 41.27 |
| 44852.145833333336 | 38.31 |
| 44852.15625 | 38.98 |
| 44852.166666666664 | 18.26 |
| 44852.177083333336 | 18.09 |
| 44852.1875 | 18.99 |
| 44852.197916666664 | 19.06 |
| 44852.208333333336 | 19.47 |
| 44852.21875 | 18.19 |
| 44852.229166666664 | 18.65 |
| 44852.239583333336 | 18.93 |
| 44852.25 | 18.61 |
| 44852.260416666664 | 19.63 |
| 44852.270833333336 | 19.17 |
| 44852.28125 | 18.87 |
| 44852.291666666664 | 18.75 |
| 44852.302083333336 | 18.5 |
| 44852.3125 | 17.77 |
| 44852.322916666664 | 18.45 |
| 44852.333333333336 | 18.7 |
| 44852.34375 | 19.11 |
| 44852.354166666664 | 19.64 |
| 44852.364583333336 | 19.46 |
| 44852.375 | 18.22 |
| 44852.385416666664 | 20.29 |
| 44852.395833333336 | 20.18 |
| 44852.40625 | 20.77 |
| 44852.416666666664 | 21.47 |
| 44852.427083333336 | 21.96 |
| 44852.4375 | 21.05 |
| 44852.447916666664 | 21.88 |
| 44852.458333333336 | 21.98 |
| 44852.46875 | 22.98 |
| 44852.479166666664 | 22.84 |
| 44852.489583333336 | 22.55 |
| 44852.5 | 22.08 |
| 44852.510416666664 | 22.39 |
| 44852.520833333336 | 22.43 |
| 44852.53125 | 25 |
| 44852.541666666664 | 25.38 |
| 44852.552083333336 | 26.24 |
| 44852.5625 | 25.17 |
| 44852.572916666664 | 25.2 |
| 44852.583333333336 | 25.36 |
| 44852.59375 | 25.59 |
| 44852.604166666664 | 26.84 |
| 44852.614583333336 | 28.1 |
| 44852.625 | 28.37 |
| 44852.635416666664 | 28.36 |
| 44852.645833333336 | 28.06 |
| 44852.65625 | 29.6 |
| 44852.666666666664 | 29.65 |
| 44852.677083333336 | 31.09 |
| 44852.6875 | 31.03 |
| 44852.697916666664 | 32.96 |
| 44852.708333333336 | 31.19 |
| 44852.71875 | 33.69 |
| 44852.729166666664 | 34.45 |
| 44852.739583333336 | 36.04 |
| 44852.75 | 36.17 |
| 44852.760416666664 | 36.32 |
| 44852.770833333336 | 35.48 |
| 44852.78125 | 36.29 |
| 44852.791666666664 | 35.95 |
| 44852.802083333336 | 35.79 |
| 44852.8125 | 36.63 |
| 44852.822916666664 | 37.8 |
| 44852.833333333336 | 37.55 |
| 44852.84375 | 36.14 |
| 44852.854166666664 | 35.34 |
| 44852.864583333336 | 34.75 |
| 44852.875 | 35.04 |
| 44852.885416666664 | 32.14 |
| 44852.895833333336 | 33.79 |
| 44852.90625 | 30.16 |
| 44852.916666666664 | 29.69 |
| 44852.927083333336 | 30.88 |
| 44852.9375 | 31.44 |
| 44852.947916666664 | 31.62 |
| 44852.958333333336 | 31.73 |
| 44852.96875 | 31.54 |
| 44852.979166666664 | 32.31 |
| 44852.989583333336 | 31.22 |
| 44853.0 | 31.27 |
| 44853.010416666664 | 30.46 |
| 44853.020833333336 | 31.66 |
| 44853.03125 | 32.82 |
| 44853.041666666664 | 30.52 |
| 44853.052083333336 | 30.27 |
| 44853.0625 | 31.82 |
| 44853.072916666664 | 32.51 |
| 44853.083333333336 | 33.1 |
| 44853.09375 | 33.41 |
| 44853.104166666664 | 33.57 |
| 44853.114583333336 | 33.72 |
| 44853.125 | 33.33 |
| 44853.135416666664 | 33.21 |
| 44853.145833333336 | 33.46 |
| 44853.15625 | 32.52 |
| 44853.166666666664 | 32.27 |
| 44853.177083333336 | 33.12 |
| 44853.1875 | 33 |
| 44853.197916666664 | 33.13 |
| 44853.208333333336 | 33.75 |
| 44853.21875 | 33.47 |
| 44853.229166666664 | 34.16 |
| 44853.239583333336 | 33.84 |
| 44853.25 | 34.82 |
| 44853.260416666664 | 35.67 |
| 44853.270833333336 | 35.8 |
| 44853.28125 | 36.41 |
| 44853.291666666664 | 37.52 |
| 44853.302083333336 | 37.48 |
| 44853.3125 | 37.25 |
| 44853.322916666664 | 37.03 |
| 44853.333333333336 | 37.25 |
| 44853.34375 | 37.84 |
| 44853.354166666664 | 36.71 |
| 44853.364583333336 | 37.09 |
| 44853.375 | 37.59 |
| 44853.385416666664 | 37.48 |
| 44853.395833333336 | 37.91 |
| 44853.40625 | 37.25 |
| 44853.416666666664 | 35.91 |
| 44853.427083333336 | 34.97 |
| 44853.4375 | 33.01 |
| 44853.447916666664 | 33.72 |
| 44853.458333333336 | 33.54 |
| 44853.46875 | 33.73 |
| 44853.479166666664 | 34.86 |
| 44853.489583333336 | 33.76 |
| 44853.5 | 33.46 |
| 44853.510416666664 | 33.52 |
| 44853.520833333336 | 34.46 |
| 44853.53125 | 33.95 |
| 44853.541666666664 | 34.54 |
| 44853.552083333336 | 34.4 |
| 44853.5625 | 36.11 |
| 44853.572916666664 | 37.79 |
| 44853.583333333336 | 38.64 |
| 44853.59375 | 39.53 |
| 44853.604166666664 | 39.83 |
| 44853.614583333336 | 39.36 |
| 44853.625 | 41.02 |
| 44853.635416666664 | 40.18 |
| 44853.645833333336 | 41.95 |
| 44853.65625 | 42.25 |
| 44853.666666666664 | 41.61 |
| 44853.677083333336 | 42.81 |
| 44853.6875 | 42.88 |
| 44853.697916666664 | 45.29 |
| 44853.708333333336 | 42.32 |
| 44853.71875 | 43.08 |
| 44853.729166666664 | 44.85 |
| 44853.739583333336 | 44.86 |
| 44853.75 | 47.76 |
| 44853.760416666664 | 47.09 |
| 44853.770833333336 | 49.21 |
| 44853.78125 | 47.65 |
| 44853.791666666664 | 49.19 |
| 44853.802083333336 | 48.3 |
| 44853.8125 | 52.1 |
| 44853.822916666664 | 53.32 |
| 44853.833333333336 | 54.01 |
| 44853.84375 | 50 |
| 44853.854166666664 | 52.13 |
| 44853.864583333336 | 50.01 |
| 44853.875 | 54.74 |
| 44853.885416666664 | 49.87 |
| 44853.895833333336 | 49.6 |
| 44853.90625 | 50.45 |
| 44853.916666666664 | 50.76 |
| 44853.927083333336 | 50.16 |
| 44853.9375 | 50.24 |
| 44853.947916666664 | 49.77 |
| 44853.958333333336 | 50.27 |
| 44853.96875 | 49.37 |
| 44853.979166666664 | 49.17 |
| 44853.989583333336 | 50.12 |
| 44854.0 | 50.55 |
| 44854.010416666664 | 50.8 |
| 44854.020833333336 | 50.52 |
| 44854.03125 | 51.44 |
| 44854.041666666664 | 48.27 |
| 44854.052083333336 | 51.21 |
| 44854.0625 | 49.71 |
| 44854.072916666664 | 48.22 |
| 44854.083333333336 | 46.93 |
| 44854.09375 | 46.4 |
| 44854.104166666664 | 46.94 |
| 44854.114583333336 | 48.23 |
| 44854.125 | 48.02 |
| 44854.135416666664 | 47.74 |
| 44854.145833333336 | 52.58 |
| 44854.15625 | 46.08 |
| 44854.166666666664 | 47.21 |
| 44854.177083333336 | 46.7 |
| 44854.1875 | 48.23 |
| 44854.197916666664 | 49.09 |
| 44854.208333333336 | 46.96 |
| 44854.21875 | 48.69 |
| 44854.229166666664 | 49.21 |
| 44854.239583333336 | 49.84 |
| 44854.25 | 49.44 |
| 44854.260416666664 | 48.67 |
| 44854.270833333336 | 50.51 |
| 44854.28125 | 51.11 |
| 44854.291666666664 | 52.04 |
| 44854.302083333336 | 51.03 |
| 44854.3125 | 51.2 |
| 44854.322916666664 | 51.6 |
| 44854.333333333336 | 52.04 |
| 44854.34375 | 51.87 |
| 44854.354166666664 | 52.23 |
| 44854.364583333336 | 53.21 |
| 44854.375 | 52.76 |
| 44854.385416666664 | 53.22 |
| 44854.395833333336 | 52.75 |
| 44854.40625 | 51.88 |
| 44854.416666666664 | 51.83 |
| 44854.427083333336 | 50.71 |
| 44854.4375 | 51.15 |
| 44854.447916666664 | 51.37 |
| 44854.458333333336 | 51.32 |
| 44854.46875 | 51.8 |
| 44854.479166666664 | 54.11 |
| 44854.489583333336 | 51.23 |
| 44854.5 | 49.42 |
| 44854.510416666664 | 47.55 |
| 44854.520833333336 | 48.63 |
| 44854.53125 | 46.14 |
| 44854.541666666664 | 46.38 |
| 44854.552083333336 | 47.79 |
| 44854.5625 | 47.1 |
| 44854.572916666664 | 45.93 |
| 44854.583333333336 | 45.97 |
| 44854.59375 | 48.19 |
| 44854.604166666664 | 48.09 |
| 44854.614583333336 | 47.58 |
| 44854.625 | 50.37 |
| 44854.635416666664 | 48.94 |
| 44854.645833333336 | 49.43 |
| 44854.65625 | 49.7 |
| 44854.666666666664 | 50.82 |
| 44854.677083333336 | 52.43 |
| 44854.6875 | 53.98 |
| 44854.697916666664 | 55.18 |
| 44854.708333333336 | 52.8 |
| 44854.71875 | 55.81 |
| 44854.729166666664 | 54.88 |
| 44854.739583333336 | 55.58 |
| 44854.75 | 56.62 |
| 44854.760416666664 | 55.88 |
| 44854.770833333336 | 56.88 |
| 44854.78125 | 53.43 |
| 44854.791666666664 | 55.27 |
| 44854.802083333336 | 54.59 |
| 44854.8125 | 55.95 |
| 44854.822916666664 | 57.03 |
| 44854.833333333336 | 57.62 |
| 44854.84375 | 58.5 |
| 44854.854166666664 | 58.51 |
| 44854.864583333336 | 57.89 |
| 44854.875 | 58.41 |
| 44854.885416666664 | 57.17 |
| 44854.895833333336 | 58.65 |
| 44854.90625 | 59.27 |
| 44854.916666666664 | 59.74 |
| 44854.927083333336 | 59.74 |
| 44854.9375 | 61.03 |
| 44854.947916666664 | 61.78 |
| 44854.958333333336 | 61.58 |
| 44854.96875 | 62.72 |
| 44854.979166666664 | 64.65 |
| 44854.989583333336 | 66.09 |
| 44855.0 | 65.47 |
| 44855.010416666664 | 65.33 |
| 44855.020833333336 | 66.75 |
| 44855.03125 | 65.5 |
| 44855.041666666664 | 65.3 |
| 44855.052083333336 | 65.71 |
| 44855.0625 | 65.47 |
| 44855.072916666664 | 65.54 |
| 44855.083333333336 | 66.66 |
| 44855.09375 | 66.55 |
| 44855.104166666664 | 65.64 |
| 44855.114583333336 | 64.62 |
| 44855.125 | 64.2 |
| 44855.135416666664 | 63.94 |
| 44855.145833333336 | 64.63 |
| 44855.15625 | 65.27 |
| 44855.166666666664 | 64.98 |
| 44855.177083333336 | 64.75 |
| 44855.1875 | 63.25 |
| 44855.197916666664 | 63.52 |
| 44855.208333333336 | 65.13 |
| 44855.21875 | 65.67 |
| 44855.229166666664 | 65.16 |
| 44855.239583333336 | 64.35 |
| 44855.25 | 65.12 |
| 44855.260416666664 | 65.57 |
| 44855.270833333336 | 64.14 |
| 44855.28125 | 63.98 |
| 44855.291666666664 | 64.36 |
| 44855.302083333336 | 63.93 |
| 44855.3125 | 64.6 |
| 44855.322916666664 | 63.59 |
| 44855.333333333336 | 64.59 |
| 44855.34375 | 64.22 |
| 44855.354166666664 | 63.66 |
| 44855.364583333336 | 64.24 |
| 44855.375 | 64.21 |
| 44855.385416666664 | 64.28 |
| 44855.395833333336 | 64.54 |
| 44855.40625 | 77.88 |
| 44855.416666666664 | 70.72 |
| 44855.427083333336 | 63.72 |
| 44855.4375 | 62.43 |
| 44855.447916666664 | 62.33 |
| 44855.458333333336 | 61.25 |
| 44855.46875 | 62.15 |
| 44855.479166666664 | 63.3 |
| 44855.489583333336 | 62.6 |
| 44855.5 | 63.84 |
| 44855.510416666664 | 63.8 |
| 44855.520833333336 | 64.87 |
| 44855.53125 | 65.95 |
| 44855.541666666664 | 67.32 |
| 44855.552083333336 | 66.56 |
| 44855.5625 | 68.89 |
| 44855.572916666664 | 69.14 |
| 44855.583333333336 | 69.11 |
| 44855.59375 | 68.46 |
| 44855.604166666664 | 70.16 |
| 44855.614583333336 | 72.65 |
| 44855.625 | 74.75 |
| 44855.635416666664 | 77.17 |
| 44855.645833333336 | 78.41 |
| 44855.65625 | 79.41 |
| 44855.666666666664 | 80.43 |
| 44855.677083333336 | 82.68 |
| 44855.6875 | 85.33 |
| 44855.697916666664 | 83.06 |
| 44855.708333333336 | 83.57 |
| 44855.71875 | 86.87 |
| 44855.729166666664 | 88.15 |
| 44855.739583333336 | 90.67 |
| 44855.75 | 92.83 |
| 44855.760416666664 | 93.47 |
| 44855.770833333336 | 91.01 |
| 44855.78125 | 92.99 |
| 44855.791666666664 | 91.35 |
| 44855.802083333336 | 92.53 |
| 44855.8125 | 94.06 |
| 44855.822916666664 | 94.12 |
| 44855.833333333336 | 91.49 |
| 44855.84375 | 90.94 |
| 44855.854166666664 | 92.02 |
| 44855.864583333336 | 90.24 |
| 44855.875 | 90.42 |
| 44855.885416666664 | 91.51 |
| 44855.895833333336 | 91.01 |
| 44855.90625 | 91.62 |
| 44855.916666666664 | 94.21 |
| 44855.927083333336 | 96.14 |
| 44855.9375 | 96.33 |
| 44855.947916666664 | 93.97 |
| 44855.958333333336 | 93.7 |
| 44855.96875 | 92.87 |
| 44855.979166666664 | 91.91 |
| 44855.989583333336 | 87.65 |
| 44856.0 | 90.21 |
| 44856.010416666664 | 92.52 |
| 44856.020833333336 | 92.47 |
| 44856.03125 | 92.83 |
| 44856.041666666664 | 92.96 |
| 44856.052083333336 | 93.96 |
| 44856.0625 | 95.1 |
| 44856.072916666664 | 97.73 |
| 44856.083333333336 | 98.7 |
| 44856.09375 | 99.64 |
| 44856.104166666664 | 98.36 |
| 44856.114583333336 | 94.45 |
| 44856.125 | 94.84 |
| 44856.135416666664 | 96.8 |
| 44856.145833333336 | 96.26 |
| 44856.15625 | 97.85 |
| 44856.166666666664 | 99.73 |
| 44856.177083333336 | 100.39 |
| 44856.1875 | 98.63 |
| 44856.197916666664 | 104.57 |
| 44856.208333333336 | 97.32 |
| 44856.21875 | 99.16 |
| 44856.229166666664 | 99.64 |
| 44856.239583333336 | 100.54 |
| 44856.25 | 101.89 |
| 44856.260416666664 | 101.99 |
| 44856.270833333336 | 102.65 |
| 44856.28125 | 102.39 |
| 44856.291666666664 | 101.76 |
| 44856.302083333336 | 102.87 |
| 44856.3125 | 102.47 |
| 44856.322916666664 | 103.13 |
| 44856.333333333336 | 101.71 |
| 44856.34375 | 100.73 |
| 44856.354166666664 | 100.5 |
| 44856.364583333336 | 101.7 |
| 44856.375 | 98.83 |
| 44856.385416666664 | 99.94 |
| 44856.395833333336 | 99.91 |
| 44856.40625 | 99.06 |
| 44856.416666666664 | 99.87 |
| 44856.427083333336 | 101.01 |
| 44856.4375 | 99.94 |
| 44856.447916666664 | 100.62 |
| 44856.458333333336 | 99.14 |
| 44856.46875 | 92.55 |
| 44856.479166666664 | 95.87 |
| 44856.489583333336 | 96.14 |
| 44856.5 | 93.75 |
| 44856.510416666664 | 93.03 |
| 44856.520833333336 | 94.88 |
| 44856.53125 | 97.19 |
| 44856.541666666664 | 98.32 |
| 44856.552083333336 | 101.67 |
| 44856.5625 | 104.53 |
| 44856.572916666664 | 104.2 |
| 44856.583333333336 | 104.15 |
| 44856.59375 | 107.57 |
| 44856.604166666664 | 109.92 |
| 44856.614583333336 | 112.28 |
| 44856.625 | 110.73 |
| 44856.635416666664 | 110.04 |
| 44856.645833333336 | 112.32 |
| 44856.65625 | 110.7 |
| 44856.666666666664 | 113.58 |
| 44856.677083333336 | 111.61 |
| 44856.6875 | 117.04 |
| 44856.697916666664 | 115 |
| 44856.708333333336 | 112.97 |
| 44856.71875 | 114.39 |
| 44856.729166666664 | 114.15 |
| 44856.739583333336 | 116.75 |
| 44856.75 | 117.55 |
| 44856.760416666664 | 121.33 |
| 44856.770833333336 | 120.08 |
| 44856.78125 | 122.77 |
| 44856.791666666664 | 123.17 |
| 44856.802083333336 | 124.99 |
| 44856.8125 | 124.32 |
| 44856.822916666664 | 126.6 |
| 44856.833333333336 | 125.86 |
| 44856.84375 | 122.48 |
| 44856.854166666664 | 125.02 |
| 44856.864583333336 | 125.2 |
| 44856.875 | 124.39 |
| 44856.885416666664 | 127.77 |
| 44856.895833333336 | 124.01 |
| 44856.90625 | 129.23 |
| 44856.916666666664 | 128.43 |
| 44856.927083333336 | 128.64 |
| 44856.9375 | 126.01 |
| 44856.947916666664 | 127.42 |
| 44856.958333333336 | 126.43 |
| 44856.96875 | 126.45 |
| 44856.979166666664 | 121.28 |
| 44856.989583333336 | 119.02 |
| 44857.0 | 119.89 |
| 44857.010416666664 | 119.68 |
| 44857.020833333336 | 119.17 |
| 44857.03125 | 119.58 |
| 44857.041666666664 | 116.23 |
| 44857.052083333336 | 117.33 |
| 44857.0625 | 118.16 |
| 44857.072916666664 | 119.26 |
| 44857.083333333336 | 119.75 |
| 44857.09375 | 118.54 |
| 44857.104166666664 | 120.81 |
| 44857.114583333336 | 120.66 |
| 44857.125 | 121.21 |
| 44857.135416666664 | 122.68 |
| 44857.145833333336 | 123.47 |
| 44857.15625 | 120.3 |
| 44857.166666666664 | 121.19 |
| 44857.177083333336 | 119.92 |
| 44857.1875 | 121.75 |
| 44857.197916666664 | 122.28 |
| 44857.208333333336 | 124.66 |
| 44857.21875 | 124 |
| 44857.229166666664 | 123.08 |
| 44857.239583333336 | 122.86 |
| 44857.25 | 121.77 |
| 44857.260416666664 | 122.21 |
| 44857.270833333336 | 124 |
| 44857.28125 | 124.67 |
| 44857.291666666664 | 125.62 |
| 44857.302083333336 | 124.72 |
| 44857.3125 | 122.94 |
| 44857.322916666664 | 124.39 |
| 44857.333333333336 | 123.87 |
| 44857.34375 | 122.79 |
| 44857.354166666664 | 122.4 |
| 44857.364583333336 | 122.96 |
| 44857.375 | 124.53 |
| 44857.385416666664 | 124.68 |
| 44857.395833333336 | 124.88 |
| 44857.40625 | 127.42 |
| 44857.416666666664 | 123.75 |
| 44857.427083333336 | 126.57 |
| 44857.4375 | 126.24 |
| 44857.447916666664 | 126.61 |
| 44857.458333333336 | 126.63 |
| 44857.46875 | 126.97 |
| 44857.479166666664 | 127.07 |
| 44857.489583333336 | 127.83 |
| 44857.5 | 127.01 |
| 44857.510416666664 | 126.73 |
| 44857.520833333336 | 127.94 |
| 44857.53125 | 126.71 |
| 44857.541666666664 | 122.85 |
| 44857.552083333336 | 123.73 |
| 44857.5625 | 124.88 |
| 44857.572916666664 | 126.31 |
| 44857.583333333336 | 127.69 |
| 44857.59375 | 127.57 |
| 44857.604166666664 | 126.73 |
| 44857.614583333336 | 127.45 |
| 44857.625 | 124.75 |
| 44857.635416666664 | 126.39 |
| 44857.645833333336 | 126.29 |
| 44857.65625 | 125.52 |
| 44857.666666666664 | 128.74 |
| 44857.677083333336 | 131.83 |
| 44857.6875 | 132.95 |
| 44857.697916666664 | 139.75 |
| 44857.708333333336 | 140.58 |
| 44857.71875 | 145.68 |
| 44857.729166666664 | 146.03 |
| 44857.739583333336 | 151.74 |
| 44857.75 | 153.25 |
| 44857.760416666664 | 157.52 |
| 44857.770833333336 | 153.23 |
| 44857.78125 | 154.5 |
| 44857.791666666664 | 152.58 |
| 44857.802083333336 | 156.71 |
| 44857.8125 | 151.51 |
| 44857.822916666664 | 151.24 |
| 44857.833333333336 | 150.41 |
| 44857.84375 | 150.64 |
| 44857.854166666664 | 149.65 |
| 44857.864583333336 | 149.27 |
| 44857.875 | 150.21 |
| 44857.885416666664 | 148.41 |
| 44857.895833333336 | 149.01 |
| 44857.90625 | 147.21 |
| 44857.916666666664 | 148.14 |
| 44857.927083333336 | 146.84 |
| 44857.9375 | 146.67 |
| 44857.947916666664 | 147.27 |
| 44857.958333333336 | 142 |
| 44857.96875 | 144.06 |
| 44857.979166666664 | 144.66 |
| 44857.989583333336 | 144.23 |
| 44858.0 | 140.13 |
| 44858.010416666664 | 140.19 |
| 44858.020833333336 | 144.36 |
| 44858.03125 | 142.3 |
| 44858.041666666664 | 144.63 |
| 44858.052083333336 | 144.49 |
| 44858.0625 | 144.09 |
| 44858.072916666664 | 143.22 |
| 44858.083333333336 | 146.34 |
| 44858.09375 | 141.84 |
| 44858.104166666664 | 145.98 |
| 44858.114583333336 | 141.13 |
| 44858.125 | 141.17 |
| 44858.135416666664 | 139.78 |
| 44858.145833333336 | 140.36 |
| 44858.15625 | 137.75 |
| 44858.166666666664 | 137.85 |
| 44858.177083333336 | 138.91 |
| 44858.1875 | 141.29 |
| 44858.197916666664 | 141.84 |
| 44858.208333333336 | 142.43 |
| 44858.21875 | 143.37 |
| 44858.229166666664 | 143.6 |
| 44858.239583333336 | 144.77 |
| 44858.25 | 147.16 |
| 44858.260416666664 | 146.03 |
| 44858.270833333336 | 145.4 |
| 44858.28125 | 142.87 |
| 44858.291666666664 | 144.12 |
| 44858.302083333336 | 143.99 |
| 44858.3125 | 144.95 |
| 44858.322916666664 | 145.86 |
| 44858.333333333336 | 144.9 |
| 44858.34375 | 144.23 |
| 44858.354166666664 | 142.78 |
| 44858.364583333336 | 138.48 |
| 44858.375 | 135.1 |
| 44858.385416666664 | 134.28 |
| 44858.395833333336 | 134.25 |
| 44858.40625 | 136.3 |
| 44858.416666666664 | 138.06 |
| 44858.427083333336 | 139.82 |
| 44858.4375 | 137.6 |
| 44858.447916666664 | 137.94 |
| 44858.458333333336 | 140.13 |
| 44858.46875 | 141.4 |
| 44858.479166666664 | 142.74 |
| 44858.489583333336 | 144.45 |
| 44858.5 | 147.52 |
| 44858.510416666664 | 146.38 |
| 44858.520833333336 | 146.06 |
| 44858.53125 | 143.53 |
| 44858.541666666664 | 146.13 |
| 44858.552083333336 | 144.68 |
| 44858.5625 | 146.67 |
| 44858.572916666664 | 147.74 |
| 44858.583333333336 | 145.97 |
| 44858.59375 | 148.86 |
| 44858.604166666664 | 152.6 |
| 44858.614583333336 | 148.03 |
| 44858.625 | 148.71 |
| 44858.635416666664 | 153.33 |
| 44858.645833333336 | 193.27 |
| 44858.65625 | 133.62 |
| 44858.666666666664 | 132.67 |
| 44858.677083333336 | 137.62 |
| 44858.6875 | 132.74 |
| 44858.697916666664 | 135.69 |
| 44858.708333333336 | 141.78 |
| 44858.71875 | 144.99 |
| 44858.729166666664 | 137.34 |
| 44858.739583333336 | 136.06 |
| 44858.75 | 146.94 |
| 44858.760416666664 | 149.78 |
| 44858.770833333336 | 149.5 |
| 44858.78125 | 152.19 |
| 44858.791666666664 | 146.88 |
| 44858.802083333336 | 147.87 |
| 44858.8125 | 143.61 |
| 44858.822916666664 | 147.13 |
| 44858.833333333336 | 153.96 |
| 44858.84375 | 149.8 |
| 44858.854166666664 | 151.24 |
| 44858.864583333336 | 149.52 |
| 44858.875 | 144.45 |
| 44858.885416666664 | 144.78 |
| 44858.895833333336 | 149.26 |
| 44858.90625 | 149.19 |
| 44858.916666666664 | 146.16 |
| 44858.927083333336 | 147.15 |
| 44858.9375 | 147.77 |
| 44858.947916666664 | 147.15 |
| 44858.958333333336 | 146.39 |
| 44858.96875 | 151.59 |
| 44858.979166666664 | 150.41 |
| 44858.989583333336 | 150.94 |
| 44859.0 | 150.1 |
| 44859.010416666664 | 152.16 |
| 44859.020833333336 | 149.74 |
| 44859.03125 | 152.32 |
| 44859.041666666664 | 150.38 |
| 44859.052083333336 | 146.6 |
| 44859.0625 | 146 |
| 44859.072916666664 | 145.76 |
| 44859.083333333336 | 147.12 |
| 44859.09375 | 145.57 |
| 44859.104166666664 | 147.69 |
| 44859.114583333336 | 148.12 |
| 44859.125 | 147.4 |
| 44859.135416666664 | 147.53 |
| 44859.145833333336 | 142.6 |
| 44859.15625 | 148.81 |
| 44859.166666666664 | 149.3 |
| 44859.177083333336 | 148.91 |
| 44859.1875 | 148.91 |
| 44859.197916666664 | 144.47 |
| 44859.208333333336 | 142.41 |
| 44859.21875 | 144.02 |
| 44859.229166666664 | 138.45 |
| 44859.239583333336 | 138.02 |
| 44859.25 | 139.7 |
| 44859.260416666664 | 132.42 |
| 44859.270833333336 | 139.07 |
| 44859.28125 | 138.92 |
| 44859.291666666664 | 137.86 |
| 44859.302083333336 | 138.26 |
| 44859.3125 | 137.46 |
| 44859.322916666664 | 137.89 |
| 44859.333333333336 | 139.47 |
| 44859.34375 | 135.88 |
| 44859.354166666664 | 137.23 |
| 44859.364583333336 | 135.85 |
| 44859.375 | 135.19 |
| 44859.385416666664 | 133.93 |
| 44859.395833333336 | 135.77 |
| 44859.40625 | 137.52 |
| 44859.416666666664 | 129.81 |
| 44859.427083333336 | 135 |
| 44859.4375 | 137.96 |
| 44859.447916666664 | 134.44 |
| 44859.458333333336 | 135.65 |
| 44859.46875 | 138.08 |
| 44859.479166666664 | 135.35 |
| 44859.489583333336 | 135.74 |
| 44859.5 | 135.5 |
| 44859.510416666664 | 138.93 |
| 44859.520833333336 | 132.87 |
| 44859.53125 | 136.59 |
| 44859.541666666664 | 140.65 |
| 44859.552083333336 | 134.74 |
| 44859.5625 | 134.98 |
| 44859.572916666664 | 133.59 |
| 44859.583333333336 | 134.69 |
| 44859.59375 | 135.37 |
| 44859.604166666664 | 145.32 |
| 44859.614583333336 | 148.12 |
| 44859.625 | 150.76 |
| 44859.635416666664 | 146.94 |
| 44859.645833333336 | 149.1 |
| 44859.65625 | 147.55 |
| 44859.666666666664 | 148.2 |
| 44859.677083333336 | 153.41 |
| 44859.6875 | 149.92 |
| 44859.697916666664 | 151.43 |
| 44859.708333333336 | 146.24 |
| 44859.71875 | 148.15 |
| 44859.729166666664 | 149.99 |
| 44859.739583333336 | 148.58 |
| 44859.75 | 148.75 |
| 44859.760416666664 | 152.2 |
| 44859.770833333336 | 147.75 |
| 44859.78125 | 154.2 |
| 44859.791666666664 | 157.56 |
| 44859.802083333336 | 155.73 |
| 44859.8125 | 168.83 |
| 44859.822916666664 | 162.62 |
| 44859.833333333336 | 158.24 |
| 44859.84375 | 163 |
| 44859.854166666664 | 156.26 |
| 44859.864583333336 | 168.61 |
| 44859.875 | 165.5 |
| 44859.885416666664 | 160.49 |
| 44859.895833333336 | 156.88 |
| 44859.90625 | 163.02 |
| 44859.916666666664 | 153.07 |
| 44859.927083333336 | 158.09 |
| 44859.9375 | 165.84 |
| 44859.947916666664 | 159.88 |
| 44859.958333333336 | 163.02 |
| 44859.96875 | 165.03 |
| 44859.979166666664 | 161.6 |
| 44859.989583333336 | 159.4 |
| 44860.0 | 161.12 |
| 44860.010416666664 | 153.34 |
| 44860.020833333336 | 161.41 |
| 44860.03125 | 156.44 |
| 44860.041666666664 | 157.03 |
| 44860.052083333336 | 148.42 |
| 44860.0625 | 153.14 |
| 44860.072916666664 | 152.92 |
| 44860.083333333336 | 150.74 |
| 44860.09375 | 149.17 |
| 44860.104166666664 | 146.74 |
| 44860.114583333336 | 139.21 |
| 44860.125 | 140.42 |
| 44860.135416666664 | 137 |
| 44860.145833333336 | 136.81 |
| 44860.15625 | 125.05 |
| 44860.166666666664 | 125.63 |
| 44860.177083333336 | 125.57 |
| 44860.1875 | 123.73 |
| 44860.197916666664 | 125.03 |
| 44860.208333333336 | 124.7 |
| 44860.21875 | 125.26 |
| 44860.229166666664 | 121.86 |
| 44860.239583333336 | 121.43 |
| 44860.25 | 125.74 |
| 44860.260416666664 | 119.36 |
| 44860.270833333336 | 125.85 |
| 44860.28125 | 126.93 |
| 44860.291666666664 | 115.11 |
| 44860.302083333336 | 116.52 |
| 44860.3125 | 143.12 |
| 44860.322916666664 | 111.32 |
| 44860.333333333336 | 107.63 |
| 44860.34375 | 105.43 |
| 44860.354166666664 | 104.98 |
| 44860.364583333336 | 104.68 |
| 44860.375 | 93.54 |
| 44860.385416666664 | 108.11 |
| 44860.395833333336 | 108.08 |
| 44860.40625 | 106.78 |
| 44860.416666666664 | 111.55 |
| 44860.427083333336 | 117.58 |
| 44860.4375 | 110.95 |
| 44860.447916666664 | 108.04 |
| 44860.458333333336 | 105.54 |
| 44860.46875 | 109.78 |
| 44860.479166666664 | 103.3 |
| 44860.489583333336 | 109.14 |
| 44860.5 | 108.25 |
| 44860.510416666664 | 101.76 |
| 44860.520833333336 | 90.6 |
| 44860.53125 | 91.43 |
| 44860.541666666664 | 89.26 |
| 44860.552083333336 | 88.98 |
| 44860.5625 | 90.28 |
| 44860.572916666664 | 90.14 |
| 44860.583333333336 | 92.68 |
| 44860.59375 | 92.72 |
| 44860.604166666664 | 92.36 |
| 44860.614583333336 | 94.46 |
| 44860.625 | 94.28 |
| 44860.635416666664 | 94.7 |
| 44860.645833333336 | 93.46 |
| 44860.65625 | 95.87 |
| 44860.666666666664 | 96.33 |
| 44860.677083333336 | 96 |
| 44860.6875 | 97.04 |
| 44860.697916666664 | 99.1 |
| 44860.708333333336 | 97.49 |
| 44860.71875 | 100.52 |
| 44860.729166666664 | 105.75 |
| 44860.739583333336 | 107.29 |
| 44860.75 | 108.19 |
| 44860.760416666664 | 106.3 |
| 44860.770833333336 | 109.53 |
| 44860.78125 | 111.44 |
| 44860.791666666664 | 111.19 |
| 44860.802083333336 | 113.09 |
| 44860.8125 | 110.51 |
| 44860.822916666664 | 112.66 |
| 44860.833333333336 | 112.15 |
| 44860.84375 | 108.23 |
| 44860.854166666664 | 116.27 |
| 44860.864583333336 | 118.3 |
| 44860.875 | 121.52 |
| 44860.885416666664 | 127.74 |
| 44860.895833333336 | 128.08 |
| 44860.90625 | 126.26 |
| 44860.916666666664 | 114.04 |
| 44860.927083333336 | 122.25 |
| 44860.9375 | 128.23 |
| 44860.947916666664 | 127.7 |
| 44860.958333333336 | 121.41 |
| 44860.96875 | 138.13 |
| 44860.979166666664 | 118.29 |
| 44860.989583333336 | 126.31 |
| 44861.0 | 116.53 |
| 44861.010416666664 | 124.33 |
| 44861.020833333336 | 125.63 |
| 44861.03125 | 125.77 |
| 44861.041666666664 | 116.41 |
| 44861.052083333336 | 121.9 |
| 44861.0625 | 120.83 |
| 44861.072916666664 | 114.79 |
| 44861.083333333336 | 117.86 |
| 44861.09375 | 115.6 |
| 44861.104166666664 | 116.28 |
| 44861.114583333336 | 116.56 |
| 44861.125 | 112.83 |
| 44861.135416666664 | 118.32 |
| 44861.145833333336 | 116.85 |
| 44861.15625 | 112.9 |
| 44861.166666666664 | 63.5 |
| 44861.177083333336 | 65.91 |
| 44861.1875 | 65.7 |
| 44861.197916666664 | 63.72 |
| 44861.208333333336 | 63.9 |
| 44861.21875 | 63.69 |
| 44861.229166666664 | 64.32 |
| 44861.239583333336 | 66.46 |
| 44861.25 | 66 |
| 44861.260416666664 | 65.25 |
| 44861.270833333336 | 63.59 |
| 44861.28125 | 63.6 |
| 44861.291666666664 | 64.62 |
| 44861.302083333336 | 62.97 |
| 44861.3125 | 61.68 |
| 44861.322916666664 | 61.96 |
| 44861.333333333336 | 63.09 |
| 44861.34375 | 64.25 |
| 44861.354166666664 | 70.07 |
| 44861.364583333336 | 68.87 |
| 44861.375 | 68.16 |
| 44861.385416666664 | 68.18 |
| 44861.395833333336 | 67.67 |
| 44861.40625 | 65.63 |
| 44861.416666666664 | 67.57 |
| 44861.427083333336 | 67 |
| 44861.4375 | 66.47 |
| 44861.447916666664 | 64.71 |
| 44861.458333333336 | 62.76 |
| 44861.46875 | 65.44 |
| 44861.479166666664 | 65.76 |
| 44861.489583333336 | 68.16 |
| 44861.5 | 72.03 |
| 44861.510416666664 | 65.11 |
| 44861.520833333336 | 70.97 |
| 44861.53125 | 64.31 |
| 44861.541666666664 | 73.17 |
| 44861.552083333336 | 73.5 |
| 44861.5625 | 81.18 |
| 44861.572916666664 | 77.37 |
| 44861.583333333336 | 80.96 |
| 44861.59375 | 79.56 |
| 44861.604166666664 | 78.77 |
| 44861.614583333336 | 71.05 |
| 44861.625 | 99.77 |
| 44861.635416666664 | 72.5 |
| 44861.645833333336 | 73.57 |
| 44861.65625 | 72.34 |
| 44861.666666666664 | 73.4 |
| 44861.677083333336 | 72.71 |
| 44861.6875 | 70.92 |
| 44861.697916666664 | 67.04 |
| 44861.708333333336 | 66.53 |
| 44861.71875 | 67.73 |
| 44861.729166666664 | 69.01 |
| 44861.739583333336 | 68.79 |
| 44861.75 | 72.64 |
| 44861.760416666664 | 71.75 |
| 44861.770833333336 | 75.71 |
| 44861.78125 | 74.84 |
| 44861.791666666664 | 76.3 |
| 44861.802083333336 | 73.95 |
| 44861.8125 | 71.59 |
| 44861.822916666664 | 69.78 |
| 44861.833333333336 | 72.38 |
| 44861.84375 | 70.18 |
| 44861.854166666664 | 72.46 |
| 44861.864583333336 | 74.55 |
| 44861.875 | 75.67 |
| 44861.885416666664 | 76.47 |
| 44861.895833333336 | 76.32 |
| 44861.90625 | 76.31 |
| 44861.916666666664 | 75.83 |
| 44861.927083333336 | 75.03 |
| 44861.9375 | 76.01 |
| 44861.947916666664 | 71.21 |
| 44861.958333333336 | 72.78 |
| 44861.96875 | 73.04 |
| 44861.979166666664 | 71.9 |
| 44861.989583333336 | 70.88 |
| 44862.0 | 70.59 |
| 44862.010416666664 | 72.83 |
| 44862.020833333336 | 72.78 |
| 44862.03125 | 74.92 |
| 44862.041666666664 | 75.52 |
| 44862.052083333336 | 75.33 |
| 44862.0625 | 78.15 |
| 44862.072916666664 | 74.6 |
| 44862.083333333336 | 75.66 |
| 44862.09375 | 74.17 |
| 44862.104166666664 | 73.59 |
| 44862.114583333336 | 73.42 |
| 44862.125 | 72.4 |
| 44862.135416666664 | 72.07 |
| 44862.145833333336 | 72.51 |
| 44862.15625 | 73.33 |
| 44862.166666666664 | 72.75 |
| 44862.177083333336 | 75.13 |
| 44862.1875 | 74.85 |
| 44862.197916666664 | 75.23 |
| 44862.208333333336 | 75.13 |
| 44862.21875 | 76.88 |
| 44862.229166666664 | 74.86 |
| 44862.239583333336 | 75.3 |
| 44862.25 | 76.16 |
| 44862.260416666664 | 76.5 |
| 44862.270833333336 | 76.63 |
| 44862.28125 | 76.6 |
| 44862.291666666664 | 77.75 |
| 44862.302083333336 | 77.14 |
| 44862.3125 | 77.69 |
| 44862.322916666664 | 77.76 |
| 44862.333333333336 | 76.59 |
| 44862.34375 | 77.72 |
| 44862.354166666664 | 78.37 |
| 44862.364583333336 | 79.32 |
| 44862.375 | 78.97 |
| 44862.385416666664 | 79.76 |
| 44862.395833333336 | 80.35 |
| 44862.40625 | 82.82 |
| 44862.416666666664 | 84 |
| 44862.427083333336 | 85.8 |
| 44862.4375 | 85.41 |
| 44862.447916666664 | 85.44 |
| 44862.458333333336 | 82.55 |
| 44862.46875 | 83.24 |
| 44862.479166666664 | 82.74 |
| 44862.489583333336 | 84.48 |
| 44862.5 | 85.57 |
| 44862.510416666664 | 83.45 |
| 44862.520833333336 | 84.34 |
| 44862.53125 | 85.29 |
| 44862.541666666664 | 85.7 |
| 44862.552083333336 | 86.74 |
| 44862.5625 | 84.64 |
| 44862.572916666664 | 80.17 |
| 44862.583333333336 | 78.41 |
| 44862.59375 | 78.41 |
| 44862.604166666664 | 79.98 |
| 44862.614583333336 | 78.6 |
| 44862.625 | 76.35 |
| 44862.635416666664 | 79.52 |
| 44862.645833333336 | 76.11 |
| 44862.65625 | 77.67 |
| 44862.666666666664 | 73.89 |
| 44862.677083333336 | 71.74 |
| 44862.6875 | 70.08 |
| 44862.697916666664 | 70.88 |
| 44862.708333333336 | 71.5 |
| 44862.71875 | 71.55 |
| 44862.729166666664 | 72.52 |
| 44862.739583333336 | 71.21 |
| 44862.75 | 70.18 |
| 44862.760416666664 | 71.26 |
| 44862.770833333336 | 72.77 |
| 44862.78125 | 74 |
| 44862.791666666664 | 78.04 |
| 44862.802083333336 | 76.16 |
| 44862.8125 | 74.69 |
| 44862.822916666664 | 77.02 |
| 44862.833333333336 | 76.82 |
| 44862.84375 | 81.2 |
| 44862.854166666664 | 78.32 |
| 44862.864583333336 | 80.39 |
| 44862.875 | 78.33 |
| 44862.885416666664 | 79.37 |
| 44862.895833333336 | 74.51 |
| 44862.90625 | 73.58 |
| 44862.916666666664 | 74.23 |
| 44862.927083333336 | 74.48 |
| 44862.9375 | 73.84 |
| 44862.947916666664 | 70.43 |
| 44862.958333333336 | 70.06 |
| 44862.96875 | 68.9 |
| 44862.979166666664 | 71.18 |
| 44862.989583333336 | 71.77 |
| 44863.0 | 72.78 |
| 44863.010416666664 | 73.32 |
| 44863.020833333336 | 72 |
| 44863.03125 | 72.44 |
| 44863.041666666664 | 73.18 |
| 44863.052083333336 | 73.07 |
| 44863.0625 | 73.5 |
| 44863.072916666664 | 73.75 |
| 44863.083333333336 | 73.51 |
| 44863.09375 | 73.95 |
| 44863.104166666664 | 73.59 |
| 44863.114583333336 | 74.48 |
| 44863.125 | 73.92 |
| 44863.135416666664 | 75.4 |
| 44863.145833333336 | 84.33 |
| 44863.15625 | 81.2 |
| 44863.166666666664 | 83.49 |
| 44863.177083333336 | 83.12 |
| 44863.1875 | 83.25 |
| 44863.197916666664 | 84.63 |
| 44863.208333333336 | 81.57 |
| 44863.21875 | 81.2 |
| 44863.229166666664 | 74.48 |
| 44863.239583333336 | 77.45 |
| 44863.25 | 77.39 |
| 44863.260416666664 | 79.53 |
| 44863.270833333336 | 77.89 |
| 44863.28125 | 79.75 |
| 44863.291666666664 | 78.99 |
| 44863.302083333336 | 80.23 |
| 44863.3125 | 82.12 |
| 44863.322916666664 | 82.02 |
| 44863.333333333336 | 79.36 |
| 44863.34375 | 80.8 |
| 44863.354166666664 | 78.88 |
| 44863.364583333336 | 79.37 |
| 44863.375 | 79.48 |
| 44863.385416666664 | 79.54 |
| 44863.395833333336 | 78.64 |
| 44863.40625 | 79.04 |
| 44863.416666666664 | 79.6 |
| 44863.427083333336 | 77.51 |
| 44863.4375 | 78.02 |
| 44863.447916666664 | 77.35 |
| 44863.458333333336 | 79.58 |
| 44863.46875 | 74.41 |
| 44863.479166666664 | 77.05 |
| 44863.489583333336 | 73.55 |
| 44863.5 | 76.56 |
| 44863.510416666664 | 76.08 |
| 44863.520833333336 | 75.47 |
| 44863.53125 | 75.61 |
| 44863.541666666664 | 77.39 |
| 44863.552083333336 | 79.86 |
| 44863.5625 | 80.58 |
| 44863.572916666664 | 82.86 |
| 44863.583333333336 | 85.53 |
| 44863.59375 | 88.81 |
| 44863.604166666664 | 89.02 |
| 44863.614583333336 | 91.9 |
| 44863.625 | 89.95 |
| 44863.635416666664 | 89.6 |
| 44863.645833333336 | 89.81 |
| 44863.65625 | 89.63 |
| 44863.666666666664 | 86.83 |
| 44863.677083333336 | 85.67 |
| 44863.6875 | 88.7 |
| 44863.697916666664 | 85.98 |
| 44863.708333333336 | 87.83 |
| 44863.71875 | 88.24 |
| 44863.729166666664 | 89.87 |
| 44863.739583333336 | 71.31 |
| 44863.75 | 18.85 |
| 44863.760416666664 | 19.35 |
| 44863.770833333336 | 20.98 |
| 44863.78125 | 22.28 |
| 44863.791666666664 | 18.15 |
| 44863.802083333336 | 19.27 |
| 44863.8125 | 18.64 |
| 44863.822916666664 | 19.44 |
| 44863.833333333336 | 21.15 |
| 44863.84375 | 127.7 |
| 44863.854166666664 | 20.55 |
| 44863.864583333336 | 20 |
| 44863.875 | 21.03 |
| 44863.885416666664 | 22.92 |
| 44863.895833333336 | 24.33 |
| 44863.90625 | 22.55 |
| 44863.916666666664 | 23.46 |
| 44863.927083333336 | 23.87 |
| 44863.9375 | 23.28 |
| 44863.947916666664 | 23.93 |
| 44863.958333333336 | 23.16 |
| 44863.96875 | 23.6 |
| 44863.979166666664 | 22.39 |
| 44863.989583333336 | 22.14 |
| 44864.0 | 24.32 |
| 44864.010416666664 | 23.3 |
| 44864.020833333336 | 23.86 |
| 44864.03125 | 23.42 |
| 44864.041666666664 | 23.28 |
| 44864.052083333336 | 23.15 |
| 44864.0625 | 21.38 |
| 44864.072916666664 | 22.56 |
| 44864.083333333336 | 22.09 |
| 44864.09375 | 21.71 |
| 44864.104166666664 | 20.08 |
| 44864.114583333336 | 21.15 |
| 44864.125 | 20.78 |
| 44864.135416666664 | 20.59 |
| 44864.145833333336 | 20.67 |
| 44864.15625 | 20.55 |
| 44864.166666666664 | 131.41 |
| 44864.177083333336 | 20.07 |
| 44864.1875 | 31.14 |
| 44864.197916666664 | 20.28 |
| 44864.208333333336 | 20.92 |
| 44864.21875 | 83.43 |
| 44864.229166666664 | 98.88 |
| 44864.239583333336 | 47.15 |
| 44864.25 | 57.38 |
| 44864.260416666664 | 19.61 |
| 44864.270833333336 | 234.01 |
| 44864.28125 | 60.23 |
| 44864.291666666664 | 41.57 |
| 44864.302083333336 | 21.45 |
| 44864.3125 | 20.28 |
| 44864.322916666664 | 19.44 |
| 44864.333333333336 | 18.98 |
| 44864.34375 | 20.26 |
| 44864.354166666664 | 20.46 |
| 44864.364583333336 | 19.95 |
| 44864.375 | 20.5 |
| 44864.385416666664 | 20.72 |
| 44864.395833333336 | 20.63 |
| 44864.40625 | 21.24 |
| 44864.416666666664 | 20.77 |
| 44864.427083333336 | 21.23 |
| 44864.4375 | 21.5 |
| 44864.447916666664 | 21.32 |
| 44864.458333333336 | 21.66 |
| 44864.46875 | 21.82 |
| 44864.479166666664 | 23.01 |
| 44864.489583333336 | 22.25 |
| 44864.5 | 21.39 |
| 44864.510416666664 | 21.72 |
| 44864.520833333336 | 21.23 |
| 44864.53125 | 21.71 |
| 44864.541666666664 | 21.15 |
| 44864.552083333336 | 21.76 |
| 44864.5625 | 22.28 |
| 44864.572916666664 | 21.99 |
| 44864.583333333336 | 21.83 |
| 44864.59375 | 21.9 |
| 44864.604166666664 | 22.57 |
| 44864.614583333336 | 22.74 |
| 44864.625 | 23.26 |
| 44864.635416666664 | 20.98 |
| 44864.645833333336 | 25.08 |
| 44864.65625 | 23.68 |
| 44864.666666666664 | 25.12 |
| 44864.677083333336 | 24.49 |
| 44864.6875 | 25.92 |
| 44864.697916666664 | 25.64 |
| 44864.708333333336 | 25.79 |
| 44864.71875 | 25.84 |
| 44864.729166666664 | 24.99 |
| 44864.739583333336 | 23 |
| 44864.75 | 23.92 |
| 44864.760416666664 | 25.49 |
| 44864.770833333336 | 24.62 |
| 44864.78125 | 24.77 |
| 44864.791666666664 | 23.42 |
| 44864.802083333336 | 23.16 |
| 44864.8125 | 23.19 |
| 44864.822916666664 | 22.47 |
| 44864.833333333336 | 22.66 |
| 44864.84375 | 24.71 |
| 44864.854166666664 | 24.31 |
| 44864.864583333336 | 25.33 |
| 44864.875 | 25.36 |
| 44864.885416666664 | 25.23 |
| 44864.895833333336 | 26.17 |
| 44864.90625 | 26.32 |
| 44864.916666666664 | 27.16 |
| 44864.927083333336 | 26.54 |
| 44864.9375 | 26.2 |
| 44864.947916666664 | 26.53 |
| 44864.958333333336 | 61.81 |
| 44864.96875 | 49.85 |
| 44864.979166666664 | 27.22 |
| 44864.989583333336 | 34.83 |
| 44865.0 | 31.69 |
| 44865.010416666664 | 32.18 |
| 44865.020833333336 | 30.24 |
| 44865.03125 | 90.54 |
| 44865.041666666664 | 25.6 |
| 44865.052083333336 | 25.44 |
| 44865.0625 | 25.2 |
| 44865.072916666664 | 24.84 |
| 44865.083333333336 | 24.48 |
| 44865.09375 | 24.58 |
| 44865.104166666664 | 24.17 |
| 44865.114583333336 | 24.39 |
| 44865.125 | 23.55 |
| 44865.135416666664 | 24.23 |
| 44865.145833333336 | 23.48 |
| 44865.15625 | 24.54 |
| 44865.166666666664 | 24.63 |
| 44865.177083333336 | 25.23 |
| 44865.1875 | 25.06 |
| 44865.197916666664 | 24.57 |
| 44865.208333333336 | 24.77 |
| 44865.21875 | 24.72 |
| 44865.229166666664 | 24.42 |
| 44865.239583333336 | 23.69 |
| 44865.25 | 23.77 |
| 44865.260416666664 | 24.55 |
| 44865.270833333336 | 24.35 |
| 44865.28125 | 23.94 |
| 44865.291666666664 | 24.25 |
| 44865.302083333336 | 24.66 |
| 44865.3125 | 24.09 |
| 44865.322916666664 | 23.98 |
| 44865.333333333336 | 23.48 |
| 44865.34375 | 22.54 |
| 44865.354166666664 | 23.93 |
| 44865.364583333336 | 24.6 |
| 44865.375 | 24.34 |
| 44865.385416666664 | 23.56 |
| 44865.395833333336 | 23.81 |
| 44865.40625 | 25.47 |
| 44865.416666666664 | 25.54 |
| 44865.427083333336 | 25.64 |
| 44865.4375 | 25.96 |
| 44865.447916666664 | 26.08 |
| 44865.458333333336 | 25.81 |
| 44865.46875 | 26.75 |
| 44865.479166666664 | 27.86 |
| 44865.489583333336 | 27.52 |
| 44865.5 | 26.92 |
| 44865.510416666664 | 25.38 |
| 44865.520833333336 | 26.29 |
| 44865.53125 | 24.3 |
| 44865.541666666664 | 25.27 |
| 44865.552083333336 | 25.67 |
| 44865.5625 | 25.82 |
| 44865.572916666664 | 26.2 |
| 44865.583333333336 | 26.71 |
| 44865.59375 | 27.42 |
| 44865.604166666664 | 27.56 |
| 44865.614583333336 | 28.22 |
| 44865.625 | 28.87 |
| 44865.635416666664 | 29.15 |
| 44865.645833333336 | 28.4 |
| 44865.65625 | 28.7 |
| 44865.666666666664 | 28.98 |
| 44865.677083333336 | 29.94 |
| 44865.6875 | 32.26 |
| 44865.697916666664 | 30.29 |
| 44865.708333333336 | 31.23 |
| 44865.71875 | 32.37 |
| 44865.729166666664 | 32.59 |
| 44865.739583333336 | 30.58 |
| 44865.75 | 30.66 |
| 44865.760416666664 | 32.82 |
| 44865.770833333336 | 32.5 |
| 44865.78125 | 31.97 |
| 44865.791666666664 | 31.99 |
| 44865.802083333336 | 30.01 |
| 44865.8125 | 30.48 |
| 44865.822916666664 | 29.29 |
| 44865.833333333336 | 29.78 |
| 44865.84375 | 29.95 |
| 44865.854166666664 | 30.29 |
| 44865.864583333336 | 31.19 |
| 44865.875 | 32.26 |
| 44865.885416666664 | 32.88 |
| 44865.895833333336 | 33.77 |
| 44865.90625 | 32.88 |
| 44865.916666666664 | 34.8 |
| 44865.927083333336 | 34.71 |
| 44865.9375 | 34.4 |
| 44865.947916666664 | 33.84 |
| 44865.958333333336 | 34.78 |
| 44865.96875 | 34.77 |
| 44865.979166666664 | 34.45 |
| 44865.989583333336 | 34.89 |
| 44866.0 | 33.8 |
| 44866.010416666664 | 34.06 |
| 44866.020833333336 | 33.99 |
| 44866.03125 | 34.02 |
| 44866.041666666664 | 34.98 |
| 44866.052083333336 | 35.29 |
| 44866.0625 | 34.56 |
| 44866.072916666664 | 35.49 |
| 44866.083333333336 | 35.53 |
| 44866.09375 | 35.54 |
| 44866.104166666664 | 35.76 |
| 44866.114583333336 | 35.64 |
| 44866.125 | 33.56 |
| 44866.135416666664 | 31.39 |
| 44866.145833333336 | 31.59 |